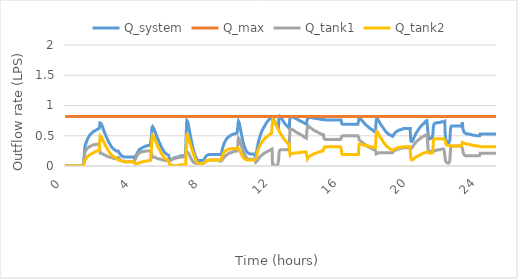
| Category | Q_system | Q_max | Q_tank1 | Q_tank2 |
|---|---|---|---|---|
| 0.0 | 0 | 0.82 | 0 | 0 |
| 0.016666666666666666 | 0 | 0.82 | 0 | 0 |
| 0.03333333333333333 | 0 | 0.82 | 0 | 0 |
| 0.05 | 0 | 0.82 | 0 | 0 |
| 0.06666666666666667 | 0 | 0.82 | 0 | 0 |
| 0.08333333333333333 | 0 | 0.82 | 0 | 0 |
| 0.09999999999999999 | 0 | 0.82 | 0 | 0 |
| 0.11666666666666665 | 0 | 0.82 | 0 | 0 |
| 0.13333333333333333 | 0 | 0.82 | 0 | 0 |
| 0.15 | 0 | 0.82 | 0 | 0 |
| 0.16666666666666666 | 0 | 0.82 | 0 | 0 |
| 0.18333333333333332 | 0 | 0.82 | 0 | 0 |
| 0.19999999999999998 | 0 | 0.82 | 0 | 0 |
| 0.21666666666666665 | 0 | 0.82 | 0 | 0 |
| 0.2333333333333333 | 0 | 0.82 | 0 | 0 |
| 0.24999999999999997 | 0 | 0.82 | 0 | 0 |
| 0.26666666666666666 | 0 | 0.82 | 0 | 0 |
| 0.2833333333333333 | 0 | 0.82 | 0 | 0 |
| 0.3 | 0 | 0.82 | 0 | 0 |
| 0.31666666666666665 | 0 | 0.82 | 0 | 0 |
| 0.3333333333333333 | 0 | 0.82 | 0 | 0 |
| 0.35 | 0 | 0.82 | 0 | 0 |
| 0.36666666666666664 | 0 | 0.82 | 0 | 0 |
| 0.3833333333333333 | 0 | 0.82 | 0 | 0 |
| 0.39999999999999997 | 0 | 0.82 | 0 | 0 |
| 0.41666666666666663 | 0 | 0.82 | 0 | 0 |
| 0.4333333333333333 | 0 | 0.82 | 0 | 0 |
| 0.44999999999999996 | 0 | 0.82 | 0 | 0 |
| 0.4666666666666666 | 0 | 0.82 | 0 | 0 |
| 0.4833333333333333 | 0 | 0.82 | 0 | 0 |
| 0.49999999999999994 | 0 | 0.82 | 0 | 0 |
| 0.5166666666666666 | 0 | 0.82 | 0 | 0 |
| 0.5333333333333333 | 0 | 0.82 | 0 | 0 |
| 0.55 | 0 | 0.82 | 0 | 0 |
| 0.5666666666666668 | 0 | 0.82 | 0 | 0 |
| 0.5833333333333335 | 0 | 0.82 | 0 | 0 |
| 0.6000000000000002 | 0 | 0.82 | 0 | 0 |
| 0.6166666666666669 | 0 | 0.82 | 0 | 0 |
| 0.6333333333333336 | 0 | 0.82 | 0 | 0 |
| 0.6500000000000004 | 0 | 0.82 | 0 | 0 |
| 0.6666666666666671 | 0 | 0.82 | 0 | 0 |
| 0.6833333333333338 | 0 | 0.82 | 0 | 0 |
| 0.7000000000000005 | 0 | 0.82 | 0 | 0 |
| 0.7166666666666672 | 0 | 0.82 | 0 | 0 |
| 0.733333333333334 | 0 | 0.82 | 0 | 0 |
| 0.7500000000000007 | 0 | 0.82 | 0 | 0 |
| 0.7666666666666674 | 0 | 0.82 | 0 | 0 |
| 0.7833333333333341 | 0 | 0.82 | 0 | 0 |
| 0.8000000000000008 | 0 | 0.82 | 0 | 0 |
| 0.8166666666666675 | 0 | 0.82 | 0 | 0 |
| 0.8333333333333343 | 0 | 0.82 | 0 | 0 |
| 0.850000000000001 | 0 | 0.82 | 0 | 0 |
| 0.8666666666666677 | 0 | 0.82 | 0 | 0 |
| 0.8833333333333344 | 0 | 0.82 | 0 | 0 |
| 0.9000000000000011 | 0 | 0.82 | 0 | 0 |
| 0.9166666666666679 | 0 | 0.82 | 0 | 0 |
| 0.9333333333333346 | 0 | 0.82 | 0 | 0 |
| 0.9500000000000013 | 0 | 0.82 | 0 | 0 |
| 0.966666666666668 | 0 | 0.82 | 0 | 0 |
| 0.9833333333333347 | 0 | 0.82 | 0 | 0 |
| 1.0000000000000013 | 0 | 0.82 | 0 | 0 |
| 1.016666666666668 | 0 | 0.82 | 0 | 0 |
| 1.0333333333333345 | 0 | 0.82 | 0 | 0 |
| 1.0500000000000012 | 0.01 | 0.82 | 0.01 | 0 |
| 1.0666666666666678 | 0.04 | 0.82 | 0.03 | 0.01 |
| 1.0833333333333344 | 0.08 | 0.82 | 0.06 | 0.02 |
| 1.100000000000001 | 0.14 | 0.82 | 0.11 | 0.04 |
| 1.1166666666666676 | 0.23 | 0.82 | 0.16 | 0.06 |
| 1.1333333333333342 | 0.29 | 0.82 | 0.21 | 0.08 |
| 1.1500000000000008 | 0.33 | 0.82 | 0.23 | 0.09 |
| 1.1666666666666674 | 0.35 | 0.82 | 0.24 | 0.1 |
| 1.183333333333334 | 0.36 | 0.82 | 0.25 | 0.11 |
| 1.2000000000000006 | 0.37 | 0.82 | 0.25 | 0.11 |
| 1.2166666666666672 | 0.38 | 0.82 | 0.26 | 0.12 |
| 1.2333333333333338 | 0.4 | 0.82 | 0.27 | 0.13 |
| 1.2500000000000004 | 0.41 | 0.82 | 0.27 | 0.14 |
| 1.266666666666667 | 0.42 | 0.82 | 0.28 | 0.14 |
| 1.2833333333333337 | 0.44 | 0.82 | 0.29 | 0.15 |
| 1.3000000000000003 | 0.45 | 0.82 | 0.29 | 0.15 |
| 1.3166666666666669 | 0.46 | 0.82 | 0.3 | 0.16 |
| 1.3333333333333335 | 0.47 | 0.82 | 0.3 | 0.16 |
| 1.35 | 0.47 | 0.82 | 0.31 | 0.17 |
| 1.3666666666666667 | 0.48 | 0.82 | 0.31 | 0.17 |
| 1.3833333333333333 | 0.49 | 0.82 | 0.31 | 0.18 |
| 1.4 | 0.5 | 0.82 | 0.32 | 0.18 |
| 1.4166666666666665 | 0.5 | 0.82 | 0.32 | 0.18 |
| 1.4333333333333331 | 0.51 | 0.82 | 0.32 | 0.19 |
| 1.4499999999999997 | 0.52 | 0.82 | 0.33 | 0.19 |
| 1.4666666666666663 | 0.52 | 0.82 | 0.33 | 0.19 |
| 1.483333333333333 | 0.53 | 0.82 | 0.33 | 0.2 |
| 1.4999999999999996 | 0.53 | 0.82 | 0.33 | 0.2 |
| 1.5166666666666662 | 0.54 | 0.82 | 0.34 | 0.2 |
| 1.5333333333333328 | 0.54 | 0.82 | 0.34 | 0.2 |
| 1.5499999999999994 | 0.55 | 0.82 | 0.34 | 0.21 |
| 1.566666666666666 | 0.55 | 0.82 | 0.34 | 0.21 |
| 1.5833333333333326 | 0.55 | 0.82 | 0.34 | 0.21 |
| 1.5999999999999992 | 0.56 | 0.82 | 0.34 | 0.21 |
| 1.6166666666666658 | 0.56 | 0.82 | 0.35 | 0.22 |
| 1.6333333333333324 | 0.57 | 0.82 | 0.35 | 0.22 |
| 1.649999999999999 | 0.57 | 0.82 | 0.35 | 0.22 |
| 1.6666666666666656 | 0.57 | 0.82 | 0.35 | 0.22 |
| 1.6833333333333322 | 0.58 | 0.82 | 0.35 | 0.23 |
| 1.6999999999999988 | 0.58 | 0.82 | 0.35 | 0.23 |
| 1.7166666666666655 | 0.58 | 0.82 | 0.35 | 0.23 |
| 1.733333333333332 | 0.59 | 0.82 | 0.35 | 0.23 |
| 1.7499999999999987 | 0.59 | 0.82 | 0.35 | 0.23 |
| 1.7666666666666653 | 0.59 | 0.82 | 0.35 | 0.24 |
| 1.7833333333333319 | 0.59 | 0.82 | 0.36 | 0.24 |
| 1.7999999999999985 | 0.6 | 0.82 | 0.36 | 0.24 |
| 1.816666666666665 | 0.6 | 0.82 | 0.36 | 0.24 |
| 1.8333333333333317 | 0.6 | 0.82 | 0.36 | 0.24 |
| 1.8499999999999983 | 0.6 | 0.82 | 0.36 | 0.25 |
| 1.866666666666665 | 0.61 | 0.82 | 0.36 | 0.25 |
| 1.8833333333333315 | 0.61 | 0.82 | 0.36 | 0.25 |
| 1.8999999999999981 | 0.61 | 0.82 | 0.36 | 0.25 |
| 1.9166666666666647 | 0.61 | 0.82 | 0.36 | 0.25 |
| 1.9333333333333313 | 0.61 | 0.82 | 0.36 | 0.25 |
| 1.949999999999998 | 0.62 | 0.82 | 0.36 | 0.25 |
| 1.9666666666666646 | 0.62 | 0.82 | 0.36 | 0.26 |
| 1.9833333333333312 | 0.62 | 0.82 | 0.36 | 0.26 |
| 1.9999999999999978 | 0.67 | 0.82 | 0.3 | 0.37 |
| 2.0166666666666644 | 0.71 | 0.82 | 0.24 | 0.47 |
| 2.033333333333331 | 0.71 | 0.82 | 0.21 | 0.5 |
| 2.0499999999999976 | 0.71 | 0.82 | 0.21 | 0.5 |
| 2.066666666666664 | 0.71 | 0.82 | 0.21 | 0.5 |
| 2.083333333333331 | 0.7 | 0.82 | 0.21 | 0.49 |
| 2.0999999999999974 | 0.69 | 0.82 | 0.21 | 0.48 |
| 2.116666666666664 | 0.68 | 0.82 | 0.21 | 0.47 |
| 2.1333333333333306 | 0.67 | 0.82 | 0.2 | 0.46 |
| 2.1499999999999972 | 0.66 | 0.82 | 0.2 | 0.45 |
| 2.166666666666664 | 0.64 | 0.82 | 0.2 | 0.44 |
| 2.1833333333333305 | 0.63 | 0.82 | 0.2 | 0.43 |
| 2.199999999999997 | 0.62 | 0.82 | 0.19 | 0.42 |
| 2.2166666666666637 | 0.6 | 0.82 | 0.19 | 0.41 |
| 2.2333333333333303 | 0.59 | 0.82 | 0.19 | 0.4 |
| 2.249999999999997 | 0.58 | 0.82 | 0.19 | 0.39 |
| 2.2666666666666635 | 0.57 | 0.82 | 0.18 | 0.38 |
| 2.28333333333333 | 0.55 | 0.82 | 0.18 | 0.37 |
| 2.2999999999999967 | 0.54 | 0.82 | 0.18 | 0.36 |
| 2.3166666666666633 | 0.53 | 0.82 | 0.18 | 0.35 |
| 2.33333333333333 | 0.52 | 0.82 | 0.17 | 0.34 |
| 2.3499999999999965 | 0.51 | 0.82 | 0.17 | 0.34 |
| 2.366666666666663 | 0.5 | 0.82 | 0.17 | 0.33 |
| 2.3833333333333298 | 0.48 | 0.82 | 0.17 | 0.32 |
| 2.3999999999999964 | 0.47 | 0.82 | 0.17 | 0.31 |
| 2.416666666666663 | 0.46 | 0.82 | 0.16 | 0.3 |
| 2.4333333333333296 | 0.45 | 0.82 | 0.16 | 0.29 |
| 2.449999999999996 | 0.44 | 0.82 | 0.16 | 0.28 |
| 2.466666666666663 | 0.43 | 0.82 | 0.16 | 0.28 |
| 2.4833333333333294 | 0.42 | 0.82 | 0.16 | 0.27 |
| 2.499999999999996 | 0.41 | 0.82 | 0.15 | 0.26 |
| 2.5166666666666626 | 0.4 | 0.82 | 0.15 | 0.25 |
| 2.533333333333329 | 0.39 | 0.82 | 0.15 | 0.24 |
| 2.549999999999996 | 0.38 | 0.82 | 0.15 | 0.24 |
| 2.5666666666666624 | 0.38 | 0.82 | 0.15 | 0.23 |
| 2.583333333333329 | 0.37 | 0.82 | 0.14 | 0.22 |
| 2.5999999999999956 | 0.36 | 0.82 | 0.14 | 0.22 |
| 2.6166666666666623 | 0.35 | 0.82 | 0.14 | 0.21 |
| 2.633333333333329 | 0.34 | 0.82 | 0.14 | 0.2 |
| 2.6499999999999955 | 0.34 | 0.82 | 0.14 | 0.2 |
| 2.666666666666662 | 0.33 | 0.82 | 0.14 | 0.19 |
| 2.6833333333333287 | 0.32 | 0.82 | 0.14 | 0.19 |
| 2.6999999999999953 | 0.32 | 0.82 | 0.14 | 0.18 |
| 2.716666666666662 | 0.31 | 0.82 | 0.13 | 0.18 |
| 2.7333333333333285 | 0.3 | 0.82 | 0.13 | 0.17 |
| 2.749999999999995 | 0.3 | 0.82 | 0.13 | 0.17 |
| 2.7666666666666617 | 0.29 | 0.82 | 0.13 | 0.16 |
| 2.7833333333333283 | 0.29 | 0.82 | 0.13 | 0.16 |
| 2.799999999999995 | 0.28 | 0.82 | 0.13 | 0.15 |
| 2.8166666666666615 | 0.28 | 0.82 | 0.13 | 0.15 |
| 2.833333333333328 | 0.27 | 0.82 | 0.13 | 0.15 |
| 2.8499999999999948 | 0.27 | 0.82 | 0.13 | 0.14 |
| 2.8666666666666614 | 0.27 | 0.82 | 0.13 | 0.14 |
| 2.883333333333328 | 0.26 | 0.82 | 0.12 | 0.14 |
| 2.8999999999999946 | 0.26 | 0.82 | 0.12 | 0.14 |
| 2.916666666666661 | 0.26 | 0.82 | 0.12 | 0.13 |
| 2.933333333333328 | 0.25 | 0.82 | 0.12 | 0.13 |
| 2.9499999999999944 | 0.25 | 0.82 | 0.12 | 0.13 |
| 2.966666666666661 | 0.25 | 0.82 | 0.12 | 0.13 |
| 2.9833333333333276 | 0.25 | 0.82 | 0.12 | 0.13 |
| 2.9999999999999942 | 0.25 | 0.82 | 0.13 | 0.12 |
| 3.016666666666661 | 0.26 | 0.82 | 0.14 | 0.11 |
| 3.0333333333333274 | 0.25 | 0.82 | 0.15 | 0.11 |
| 3.049999999999994 | 0.25 | 0.82 | 0.15 | 0.11 |
| 3.0666666666666607 | 0.25 | 0.82 | 0.14 | 0.1 |
| 3.0833333333333273 | 0.24 | 0.82 | 0.14 | 0.1 |
| 3.099999999999994 | 0.23 | 0.82 | 0.14 | 0.1 |
| 3.1166666666666605 | 0.23 | 0.82 | 0.13 | 0.1 |
| 3.133333333333327 | 0.22 | 0.82 | 0.13 | 0.09 |
| 3.1499999999999937 | 0.21 | 0.82 | 0.12 | 0.09 |
| 3.1666666666666603 | 0.21 | 0.82 | 0.12 | 0.09 |
| 3.183333333333327 | 0.2 | 0.82 | 0.11 | 0.09 |
| 3.1999999999999935 | 0.19 | 0.82 | 0.11 | 0.09 |
| 3.21666666666666 | 0.19 | 0.82 | 0.1 | 0.09 |
| 3.2333333333333267 | 0.18 | 0.82 | 0.1 | 0.08 |
| 3.2499999999999933 | 0.18 | 0.82 | 0.1 | 0.08 |
| 3.26666666666666 | 0.17 | 0.82 | 0.09 | 0.08 |
| 3.2833333333333266 | 0.17 | 0.82 | 0.09 | 0.08 |
| 3.299999999999993 | 0.17 | 0.82 | 0.09 | 0.08 |
| 3.3166666666666598 | 0.16 | 0.82 | 0.09 | 0.08 |
| 3.3333333333333264 | 0.16 | 0.82 | 0.08 | 0.08 |
| 3.349999999999993 | 0.16 | 0.82 | 0.08 | 0.08 |
| 3.3666666666666596 | 0.16 | 0.82 | 0.08 | 0.08 |
| 3.383333333333326 | 0.15 | 0.82 | 0.08 | 0.08 |
| 3.399999999999993 | 0.15 | 0.82 | 0.08 | 0.07 |
| 3.4166666666666594 | 0.15 | 0.82 | 0.08 | 0.07 |
| 3.433333333333326 | 0.15 | 0.82 | 0.08 | 0.07 |
| 3.4499999999999926 | 0.15 | 0.82 | 0.08 | 0.07 |
| 3.4666666666666592 | 0.15 | 0.82 | 0.07 | 0.07 |
| 3.483333333333326 | 0.15 | 0.82 | 0.07 | 0.07 |
| 3.4999999999999925 | 0.15 | 0.82 | 0.07 | 0.07 |
| 3.516666666666659 | 0.15 | 0.82 | 0.07 | 0.07 |
| 3.5333333333333257 | 0.15 | 0.82 | 0.07 | 0.07 |
| 3.5499999999999923 | 0.15 | 0.82 | 0.07 | 0.07 |
| 3.566666666666659 | 0.15 | 0.82 | 0.07 | 0.07 |
| 3.5833333333333255 | 0.15 | 0.82 | 0.07 | 0.07 |
| 3.599999999999992 | 0.15 | 0.82 | 0.07 | 0.07 |
| 3.6166666666666587 | 0.15 | 0.82 | 0.07 | 0.07 |
| 3.6333333333333253 | 0.15 | 0.82 | 0.07 | 0.07 |
| 3.649999999999992 | 0.15 | 0.82 | 0.07 | 0.07 |
| 3.6666666666666585 | 0.15 | 0.82 | 0.07 | 0.07 |
| 3.683333333333325 | 0.15 | 0.82 | 0.07 | 0.07 |
| 3.6999999999999917 | 0.15 | 0.82 | 0.07 | 0.07 |
| 3.7166666666666583 | 0.15 | 0.82 | 0.07 | 0.07 |
| 3.733333333333325 | 0.15 | 0.82 | 0.07 | 0.07 |
| 3.7499999999999916 | 0.15 | 0.82 | 0.07 | 0.07 |
| 3.766666666666658 | 0.15 | 0.82 | 0.07 | 0.07 |
| 3.7833333333333248 | 0.15 | 0.82 | 0.07 | 0.07 |
| 3.7999999999999914 | 0.15 | 0.82 | 0.07 | 0.07 |
| 3.816666666666658 | 0.15 | 0.82 | 0.07 | 0.07 |
| 3.8333333333333246 | 0.15 | 0.82 | 0.07 | 0.07 |
| 3.849999999999991 | 0.15 | 0.82 | 0.07 | 0.07 |
| 3.866666666666658 | 0.15 | 0.82 | 0.07 | 0.07 |
| 3.8833333333333244 | 0.15 | 0.82 | 0.07 | 0.07 |
| 3.899999999999991 | 0.15 | 0.82 | 0.07 | 0.07 |
| 3.9166666666666576 | 0.15 | 0.82 | 0.07 | 0.07 |
| 3.9333333333333242 | 0.15 | 0.82 | 0.07 | 0.07 |
| 3.949999999999991 | 0.15 | 0.82 | 0.07 | 0.07 |
| 3.9666666666666575 | 0.15 | 0.82 | 0.07 | 0.07 |
| 3.983333333333324 | 0.15 | 0.82 | 0.07 | 0.07 |
| 3.9999999999999907 | 0.13 | 0.82 | 0.08 | 0.06 |
| 4.016666666666658 | 0.13 | 0.82 | 0.08 | 0.05 |
| 4.033333333333324 | 0.13 | 0.82 | 0.09 | 0.04 |
| 4.049999999999991 | 0.13 | 0.82 | 0.1 | 0.04 |
| 4.0666666666666575 | 0.14 | 0.82 | 0.11 | 0.03 |
| 4.083333333333324 | 0.16 | 0.82 | 0.12 | 0.03 |
| 4.099999999999991 | 0.17 | 0.82 | 0.13 | 0.03 |
| 4.116666666666657 | 0.18 | 0.82 | 0.15 | 0.03 |
| 4.133333333333324 | 0.19 | 0.82 | 0.16 | 0.04 |
| 4.149999999999991 | 0.2 | 0.82 | 0.16 | 0.04 |
| 4.166666666666657 | 0.21 | 0.82 | 0.17 | 0.04 |
| 4.183333333333324 | 0.22 | 0.82 | 0.18 | 0.04 |
| 4.19999999999999 | 0.23 | 0.82 | 0.19 | 0.04 |
| 4.216666666666657 | 0.23 | 0.82 | 0.19 | 0.04 |
| 4.233333333333324 | 0.24 | 0.82 | 0.2 | 0.04 |
| 4.24999999999999 | 0.25 | 0.82 | 0.2 | 0.05 |
| 4.266666666666657 | 0.26 | 0.82 | 0.21 | 0.05 |
| 4.2833333333333234 | 0.26 | 0.82 | 0.21 | 0.05 |
| 4.29999999999999 | 0.27 | 0.82 | 0.21 | 0.05 |
| 4.316666666666657 | 0.27 | 0.82 | 0.22 | 0.05 |
| 4.333333333333323 | 0.28 | 0.82 | 0.22 | 0.06 |
| 4.34999999999999 | 0.28 | 0.82 | 0.22 | 0.06 |
| 4.3666666666666565 | 0.28 | 0.82 | 0.23 | 0.06 |
| 4.383333333333323 | 0.29 | 0.82 | 0.23 | 0.06 |
| 4.39999999999999 | 0.29 | 0.82 | 0.23 | 0.06 |
| 4.416666666666656 | 0.29 | 0.82 | 0.23 | 0.06 |
| 4.433333333333323 | 0.3 | 0.82 | 0.23 | 0.06 |
| 4.4499999999999895 | 0.3 | 0.82 | 0.23 | 0.07 |
| 4.466666666666656 | 0.3 | 0.82 | 0.24 | 0.07 |
| 4.483333333333323 | 0.3 | 0.82 | 0.24 | 0.07 |
| 4.499999999999989 | 0.31 | 0.82 | 0.24 | 0.07 |
| 4.516666666666656 | 0.31 | 0.82 | 0.24 | 0.07 |
| 4.533333333333323 | 0.31 | 0.82 | 0.24 | 0.07 |
| 4.549999999999989 | 0.31 | 0.82 | 0.24 | 0.07 |
| 4.566666666666656 | 0.32 | 0.82 | 0.24 | 0.07 |
| 4.583333333333322 | 0.32 | 0.82 | 0.24 | 0.08 |
| 4.599999999999989 | 0.32 | 0.82 | 0.24 | 0.08 |
| 4.616666666666656 | 0.32 | 0.82 | 0.24 | 0.08 |
| 4.633333333333322 | 0.32 | 0.82 | 0.24 | 0.08 |
| 4.649999999999989 | 0.32 | 0.82 | 0.25 | 0.08 |
| 4.666666666666655 | 0.33 | 0.82 | 0.25 | 0.08 |
| 4.683333333333322 | 0.33 | 0.82 | 0.25 | 0.08 |
| 4.699999999999989 | 0.33 | 0.82 | 0.25 | 0.08 |
| 4.716666666666655 | 0.33 | 0.82 | 0.25 | 0.08 |
| 4.733333333333322 | 0.33 | 0.82 | 0.25 | 0.08 |
| 4.7499999999999885 | 0.33 | 0.82 | 0.25 | 0.09 |
| 4.766666666666655 | 0.33 | 0.82 | 0.25 | 0.09 |
| 4.783333333333322 | 0.34 | 0.82 | 0.25 | 0.09 |
| 4.799999999999988 | 0.34 | 0.82 | 0.25 | 0.09 |
| 4.816666666666655 | 0.34 | 0.82 | 0.25 | 0.09 |
| 4.8333333333333215 | 0.34 | 0.82 | 0.25 | 0.09 |
| 4.849999999999988 | 0.34 | 0.82 | 0.25 | 0.09 |
| 4.866666666666655 | 0.34 | 0.82 | 0.25 | 0.09 |
| 4.883333333333321 | 0.34 | 0.82 | 0.25 | 0.09 |
| 4.899999999999988 | 0.34 | 0.82 | 0.25 | 0.09 |
| 4.9166666666666545 | 0.34 | 0.82 | 0.25 | 0.09 |
| 4.933333333333321 | 0.35 | 0.82 | 0.25 | 0.09 |
| 4.949999999999988 | 0.35 | 0.82 | 0.25 | 0.09 |
| 4.966666666666654 | 0.35 | 0.82 | 0.25 | 0.1 |
| 4.983333333333321 | 0.35 | 0.82 | 0.25 | 0.1 |
| 4.999999999999988 | 0.5 | 0.82 | 0.21 | 0.29 |
| 5.016666666666654 | 0.59 | 0.82 | 0.18 | 0.42 |
| 5.033333333333321 | 0.63 | 0.82 | 0.14 | 0.49 |
| 5.049999999999987 | 0.64 | 0.82 | 0.13 | 0.51 |
| 5.066666666666654 | 0.65 | 0.82 | 0.13 | 0.51 |
| 5.083333333333321 | 0.65 | 0.82 | 0.14 | 0.51 |
| 5.099999999999987 | 0.64 | 0.82 | 0.15 | 0.5 |
| 5.116666666666654 | 0.63 | 0.82 | 0.15 | 0.49 |
| 5.13333333333332 | 0.62 | 0.82 | 0.15 | 0.48 |
| 5.149999999999987 | 0.61 | 0.82 | 0.15 | 0.46 |
| 5.166666666666654 | 0.6 | 0.82 | 0.15 | 0.45 |
| 5.18333333333332 | 0.59 | 0.82 | 0.14 | 0.44 |
| 5.199999999999987 | 0.57 | 0.82 | 0.14 | 0.43 |
| 5.2166666666666535 | 0.56 | 0.82 | 0.14 | 0.42 |
| 5.23333333333332 | 0.55 | 0.82 | 0.14 | 0.41 |
| 5.249999999999987 | 0.53 | 0.82 | 0.14 | 0.4 |
| 5.266666666666653 | 0.52 | 0.82 | 0.13 | 0.39 |
| 5.28333333333332 | 0.51 | 0.82 | 0.13 | 0.38 |
| 5.2999999999999865 | 0.5 | 0.82 | 0.13 | 0.37 |
| 5.316666666666653 | 0.48 | 0.82 | 0.13 | 0.36 |
| 5.33333333333332 | 0.47 | 0.82 | 0.13 | 0.34 |
| 5.349999999999986 | 0.46 | 0.82 | 0.12 | 0.33 |
| 5.366666666666653 | 0.45 | 0.82 | 0.12 | 0.32 |
| 5.3833333333333195 | 0.44 | 0.82 | 0.12 | 0.31 |
| 5.399999999999986 | 0.42 | 0.82 | 0.12 | 0.3 |
| 5.416666666666653 | 0.41 | 0.82 | 0.12 | 0.29 |
| 5.433333333333319 | 0.4 | 0.82 | 0.12 | 0.29 |
| 5.449999999999986 | 0.39 | 0.82 | 0.11 | 0.28 |
| 5.466666666666653 | 0.38 | 0.82 | 0.11 | 0.27 |
| 5.483333333333319 | 0.37 | 0.82 | 0.11 | 0.26 |
| 5.499999999999986 | 0.36 | 0.82 | 0.11 | 0.25 |
| 5.516666666666652 | 0.35 | 0.82 | 0.11 | 0.24 |
| 5.533333333333319 | 0.34 | 0.82 | 0.11 | 0.23 |
| 5.549999999999986 | 0.33 | 0.82 | 0.11 | 0.22 |
| 5.566666666666652 | 0.32 | 0.82 | 0.11 | 0.21 |
| 5.583333333333319 | 0.31 | 0.82 | 0.1 | 0.2 |
| 5.599999999999985 | 0.3 | 0.82 | 0.1 | 0.2 |
| 5.616666666666652 | 0.29 | 0.82 | 0.1 | 0.19 |
| 5.633333333333319 | 0.28 | 0.82 | 0.1 | 0.18 |
| 5.649999999999985 | 0.28 | 0.82 | 0.1 | 0.17 |
| 5.666666666666652 | 0.27 | 0.82 | 0.1 | 0.17 |
| 5.6833333333333185 | 0.26 | 0.82 | 0.1 | 0.16 |
| 5.699999999999985 | 0.25 | 0.82 | 0.1 | 0.16 |
| 5.716666666666652 | 0.24 | 0.82 | 0.1 | 0.15 |
| 5.733333333333318 | 0.24 | 0.82 | 0.09 | 0.14 |
| 5.749999999999985 | 0.23 | 0.82 | 0.09 | 0.14 |
| 5.7666666666666515 | 0.23 | 0.82 | 0.09 | 0.13 |
| 5.783333333333318 | 0.22 | 0.82 | 0.09 | 0.13 |
| 5.799999999999985 | 0.22 | 0.82 | 0.09 | 0.12 |
| 5.816666666666651 | 0.21 | 0.82 | 0.09 | 0.12 |
| 5.833333333333318 | 0.21 | 0.82 | 0.09 | 0.12 |
| 5.8499999999999845 | 0.2 | 0.82 | 0.09 | 0.11 |
| 5.866666666666651 | 0.2 | 0.82 | 0.09 | 0.11 |
| 5.883333333333318 | 0.2 | 0.82 | 0.09 | 0.11 |
| 5.899999999999984 | 0.19 | 0.82 | 0.09 | 0.1 |
| 5.916666666666651 | 0.19 | 0.82 | 0.09 | 0.1 |
| 5.933333333333318 | 0.19 | 0.82 | 0.09 | 0.1 |
| 5.949999999999984 | 0.19 | 0.82 | 0.09 | 0.1 |
| 5.966666666666651 | 0.18 | 0.82 | 0.09 | 0.1 |
| 5.983333333333317 | 0.18 | 0.82 | 0.09 | 0.09 |
| 5.999999999999984 | 0.16 | 0.82 | 0.09 | 0.07 |
| 6.016666666666651 | 0.14 | 0.82 | 0.08 | 0.05 |
| 6.033333333333317 | 0.12 | 0.82 | 0.08 | 0.04 |
| 6.049999999999984 | 0.11 | 0.82 | 0.08 | 0.03 |
| 6.06666666666665 | 0.11 | 0.82 | 0.08 | 0.03 |
| 6.083333333333317 | 0.11 | 0.82 | 0.09 | 0.02 |
| 6.099999999999984 | 0.11 | 0.82 | 0.09 | 0.02 |
| 6.11666666666665 | 0.11 | 0.82 | 0.09 | 0.02 |
| 6.133333333333317 | 0.11 | 0.82 | 0.09 | 0.02 |
| 6.1499999999999835 | 0.11 | 0.82 | 0.1 | 0.01 |
| 6.16666666666665 | 0.11 | 0.82 | 0.1 | 0.01 |
| 6.183333333333317 | 0.12 | 0.82 | 0.1 | 0.01 |
| 6.199999999999983 | 0.12 | 0.82 | 0.11 | 0.01 |
| 6.21666666666665 | 0.12 | 0.82 | 0.11 | 0.01 |
| 6.2333333333333165 | 0.12 | 0.82 | 0.11 | 0.01 |
| 6.249999999999983 | 0.13 | 0.82 | 0.11 | 0.01 |
| 6.26666666666665 | 0.13 | 0.82 | 0.12 | 0.01 |
| 6.283333333333316 | 0.13 | 0.82 | 0.12 | 0.01 |
| 6.299999999999983 | 0.13 | 0.82 | 0.12 | 0.01 |
| 6.3166666666666496 | 0.13 | 0.82 | 0.12 | 0.01 |
| 6.333333333333316 | 0.13 | 0.82 | 0.12 | 0.01 |
| 6.349999999999983 | 0.14 | 0.82 | 0.13 | 0.01 |
| 6.366666666666649 | 0.14 | 0.82 | 0.13 | 0.01 |
| 6.383333333333316 | 0.14 | 0.82 | 0.13 | 0.01 |
| 6.399999999999983 | 0.14 | 0.82 | 0.13 | 0.01 |
| 6.416666666666649 | 0.14 | 0.82 | 0.13 | 0.01 |
| 6.433333333333316 | 0.14 | 0.82 | 0.13 | 0.01 |
| 6.449999999999982 | 0.15 | 0.82 | 0.13 | 0.01 |
| 6.466666666666649 | 0.15 | 0.82 | 0.13 | 0.01 |
| 6.483333333333316 | 0.15 | 0.82 | 0.14 | 0.01 |
| 6.499999999999982 | 0.15 | 0.82 | 0.14 | 0.01 |
| 6.516666666666649 | 0.15 | 0.82 | 0.14 | 0.01 |
| 6.5333333333333155 | 0.15 | 0.82 | 0.14 | 0.01 |
| 6.549999999999982 | 0.15 | 0.82 | 0.14 | 0.01 |
| 6.566666666666649 | 0.15 | 0.82 | 0.14 | 0.01 |
| 6.583333333333315 | 0.16 | 0.82 | 0.14 | 0.01 |
| 6.599999999999982 | 0.16 | 0.82 | 0.14 | 0.01 |
| 6.6166666666666485 | 0.16 | 0.82 | 0.14 | 0.01 |
| 6.633333333333315 | 0.16 | 0.82 | 0.14 | 0.02 |
| 6.649999999999982 | 0.16 | 0.82 | 0.15 | 0.02 |
| 6.666666666666648 | 0.16 | 0.82 | 0.15 | 0.02 |
| 6.683333333333315 | 0.16 | 0.82 | 0.15 | 0.02 |
| 6.6999999999999815 | 0.16 | 0.82 | 0.15 | 0.02 |
| 6.716666666666648 | 0.16 | 0.82 | 0.15 | 0.02 |
| 6.733333333333315 | 0.17 | 0.82 | 0.15 | 0.02 |
| 6.749999999999981 | 0.17 | 0.82 | 0.15 | 0.02 |
| 6.766666666666648 | 0.17 | 0.82 | 0.15 | 0.02 |
| 6.783333333333315 | 0.17 | 0.82 | 0.15 | 0.02 |
| 6.799999999999981 | 0.17 | 0.82 | 0.15 | 0.02 |
| 6.816666666666648 | 0.17 | 0.82 | 0.15 | 0.02 |
| 6.833333333333314 | 0.17 | 0.82 | 0.15 | 0.02 |
| 6.849999999999981 | 0.17 | 0.82 | 0.15 | 0.02 |
| 6.866666666666648 | 0.17 | 0.82 | 0.15 | 0.02 |
| 6.883333333333314 | 0.17 | 0.82 | 0.15 | 0.02 |
| 6.899999999999981 | 0.17 | 0.82 | 0.15 | 0.02 |
| 6.916666666666647 | 0.17 | 0.82 | 0.15 | 0.02 |
| 6.933333333333314 | 0.17 | 0.82 | 0.15 | 0.02 |
| 6.949999999999981 | 0.17 | 0.82 | 0.16 | 0.02 |
| 6.966666666666647 | 0.18 | 0.82 | 0.16 | 0.02 |
| 6.983333333333314 | 0.18 | 0.82 | 0.16 | 0.02 |
| 6.9999999999999805 | 0.42 | 0.82 | 0.21 | 0.21 |
| 7.016666666666647 | 0.56 | 0.82 | 0.23 | 0.33 |
| 7.033333333333314 | 0.71 | 0.82 | 0.25 | 0.46 |
| 7.04999999999998 | 0.75 | 0.82 | 0.23 | 0.51 |
| 7.066666666666647 | 0.75 | 0.82 | 0.23 | 0.52 |
| 7.0833333333333135 | 0.74 | 0.82 | 0.23 | 0.51 |
| 7.09999999999998 | 0.73 | 0.82 | 0.23 | 0.5 |
| 7.116666666666647 | 0.71 | 0.82 | 0.22 | 0.49 |
| 7.133333333333313 | 0.69 | 0.82 | 0.22 | 0.47 |
| 7.14999999999998 | 0.66 | 0.82 | 0.21 | 0.46 |
| 7.1666666666666465 | 0.64 | 0.82 | 0.2 | 0.44 |
| 7.183333333333313 | 0.61 | 0.82 | 0.19 | 0.43 |
| 7.19999999999998 | 0.59 | 0.82 | 0.18 | 0.41 |
| 7.216666666666646 | 0.56 | 0.82 | 0.17 | 0.39 |
| 7.233333333333313 | 0.53 | 0.82 | 0.16 | 0.38 |
| 7.24999999999998 | 0.51 | 0.82 | 0.15 | 0.36 |
| 7.266666666666646 | 0.48 | 0.82 | 0.14 | 0.35 |
| 7.283333333333313 | 0.46 | 0.82 | 0.13 | 0.33 |
| 7.299999999999979 | 0.43 | 0.82 | 0.12 | 0.31 |
| 7.316666666666646 | 0.41 | 0.82 | 0.11 | 0.3 |
| 7.333333333333313 | 0.38 | 0.82 | 0.1 | 0.28 |
| 7.349999999999979 | 0.36 | 0.82 | 0.09 | 0.27 |
| 7.366666666666646 | 0.34 | 0.82 | 0.09 | 0.25 |
| 7.383333333333312 | 0.32 | 0.82 | 0.08 | 0.24 |
| 7.399999999999979 | 0.3 | 0.82 | 0.07 | 0.22 |
| 7.416666666666646 | 0.28 | 0.82 | 0.07 | 0.21 |
| 7.433333333333312 | 0.26 | 0.82 | 0.06 | 0.2 |
| 7.449999999999979 | 0.24 | 0.82 | 0.06 | 0.18 |
| 7.4666666666666455 | 0.23 | 0.82 | 0.06 | 0.17 |
| 7.483333333333312 | 0.21 | 0.82 | 0.05 | 0.16 |
| 7.499999999999979 | 0.2 | 0.82 | 0.05 | 0.14 |
| 7.516666666666645 | 0.18 | 0.82 | 0.05 | 0.13 |
| 7.533333333333312 | 0.17 | 0.82 | 0.05 | 0.12 |
| 7.5499999999999785 | 0.16 | 0.82 | 0.05 | 0.11 |
| 7.566666666666645 | 0.15 | 0.82 | 0.05 | 0.1 |
| 7.583333333333312 | 0.14 | 0.82 | 0.05 | 0.09 |
| 7.599999999999978 | 0.13 | 0.82 | 0.04 | 0.08 |
| 7.616666666666645 | 0.12 | 0.82 | 0.04 | 0.07 |
| 7.6333333333333115 | 0.11 | 0.82 | 0.04 | 0.06 |
| 7.649999999999978 | 0.1 | 0.82 | 0.04 | 0.06 |
| 7.666666666666645 | 0.1 | 0.82 | 0.04 | 0.05 |
| 7.683333333333311 | 0.09 | 0.82 | 0.04 | 0.05 |
| 7.699999999999978 | 0.09 | 0.82 | 0.04 | 0.05 |
| 7.716666666666645 | 0.09 | 0.82 | 0.04 | 0.05 |
| 7.733333333333311 | 0.09 | 0.82 | 0.04 | 0.05 |
| 7.749999999999978 | 0.09 | 0.82 | 0.04 | 0.05 |
| 7.766666666666644 | 0.09 | 0.82 | 0.04 | 0.04 |
| 7.783333333333311 | 0.09 | 0.82 | 0.04 | 0.04 |
| 7.799999999999978 | 0.09 | 0.82 | 0.04 | 0.04 |
| 7.816666666666644 | 0.09 | 0.82 | 0.04 | 0.04 |
| 7.833333333333311 | 0.09 | 0.82 | 0.04 | 0.04 |
| 7.849999999999977 | 0.09 | 0.82 | 0.04 | 0.04 |
| 7.866666666666644 | 0.09 | 0.82 | 0.04 | 0.04 |
| 7.883333333333311 | 0.09 | 0.82 | 0.04 | 0.04 |
| 7.899999999999977 | 0.09 | 0.82 | 0.04 | 0.04 |
| 7.916666666666644 | 0.09 | 0.82 | 0.04 | 0.04 |
| 7.9333333333333105 | 0.09 | 0.82 | 0.04 | 0.04 |
| 7.949999999999977 | 0.09 | 0.82 | 0.04 | 0.04 |
| 7.966666666666644 | 0.09 | 0.82 | 0.04 | 0.04 |
| 7.98333333333331 | 0.09 | 0.82 | 0.04 | 0.04 |
| 7.999999999999977 | 0.09 | 0.82 | 0.04 | 0.04 |
| 8.016666666666644 | 0.09 | 0.82 | 0.04 | 0.05 |
| 8.033333333333312 | 0.1 | 0.82 | 0.05 | 0.05 |
| 8.04999999999998 | 0.11 | 0.82 | 0.05 | 0.05 |
| 8.066666666666647 | 0.12 | 0.82 | 0.06 | 0.06 |
| 8.083333333333314 | 0.13 | 0.82 | 0.06 | 0.06 |
| 8.099999999999982 | 0.13 | 0.82 | 0.07 | 0.07 |
| 8.11666666666665 | 0.14 | 0.82 | 0.07 | 0.07 |
| 8.133333333333317 | 0.15 | 0.82 | 0.07 | 0.07 |
| 8.149999999999984 | 0.16 | 0.82 | 0.08 | 0.08 |
| 8.166666666666652 | 0.16 | 0.82 | 0.08 | 0.08 |
| 8.18333333333332 | 0.17 | 0.82 | 0.08 | 0.08 |
| 8.199999999999987 | 0.17 | 0.82 | 0.09 | 0.09 |
| 8.216666666666654 | 0.18 | 0.82 | 0.09 | 0.09 |
| 8.233333333333322 | 0.18 | 0.82 | 0.09 | 0.09 |
| 8.24999999999999 | 0.18 | 0.82 | 0.09 | 0.09 |
| 8.266666666666657 | 0.19 | 0.82 | 0.09 | 0.09 |
| 8.283333333333324 | 0.19 | 0.82 | 0.09 | 0.09 |
| 8.299999999999992 | 0.19 | 0.82 | 0.09 | 0.09 |
| 8.31666666666666 | 0.19 | 0.82 | 0.1 | 0.1 |
| 8.333333333333327 | 0.19 | 0.82 | 0.1 | 0.1 |
| 8.349999999999994 | 0.19 | 0.82 | 0.1 | 0.1 |
| 8.366666666666662 | 0.19 | 0.82 | 0.1 | 0.1 |
| 8.38333333333333 | 0.19 | 0.82 | 0.1 | 0.1 |
| 8.399999999999997 | 0.19 | 0.82 | 0.1 | 0.1 |
| 8.416666666666664 | 0.19 | 0.82 | 0.1 | 0.1 |
| 8.433333333333332 | 0.19 | 0.82 | 0.1 | 0.1 |
| 8.45 | 0.19 | 0.82 | 0.1 | 0.1 |
| 8.466666666666667 | 0.19 | 0.82 | 0.1 | 0.1 |
| 8.483333333333334 | 0.19 | 0.82 | 0.1 | 0.1 |
| 8.500000000000002 | 0.19 | 0.82 | 0.1 | 0.1 |
| 8.51666666666667 | 0.19 | 0.82 | 0.1 | 0.1 |
| 8.533333333333337 | 0.19 | 0.82 | 0.1 | 0.1 |
| 8.550000000000004 | 0.19 | 0.82 | 0.1 | 0.1 |
| 8.566666666666672 | 0.19 | 0.82 | 0.1 | 0.1 |
| 8.58333333333334 | 0.19 | 0.82 | 0.1 | 0.1 |
| 8.600000000000007 | 0.19 | 0.82 | 0.1 | 0.1 |
| 8.616666666666674 | 0.19 | 0.82 | 0.1 | 0.1 |
| 8.633333333333342 | 0.19 | 0.82 | 0.1 | 0.1 |
| 8.65000000000001 | 0.19 | 0.82 | 0.1 | 0.1 |
| 8.666666666666677 | 0.19 | 0.82 | 0.1 | 0.1 |
| 8.683333333333344 | 0.19 | 0.82 | 0.1 | 0.1 |
| 8.700000000000012 | 0.19 | 0.82 | 0.1 | 0.1 |
| 8.71666666666668 | 0.19 | 0.82 | 0.1 | 0.1 |
| 8.733333333333347 | 0.19 | 0.82 | 0.1 | 0.1 |
| 8.750000000000014 | 0.19 | 0.82 | 0.1 | 0.1 |
| 8.766666666666682 | 0.19 | 0.82 | 0.1 | 0.1 |
| 8.78333333333335 | 0.19 | 0.82 | 0.1 | 0.1 |
| 8.800000000000017 | 0.19 | 0.82 | 0.1 | 0.1 |
| 8.816666666666684 | 0.19 | 0.82 | 0.1 | 0.1 |
| 8.833333333333352 | 0.19 | 0.82 | 0.1 | 0.1 |
| 8.85000000000002 | 0.19 | 0.82 | 0.1 | 0.1 |
| 8.866666666666687 | 0.19 | 0.82 | 0.1 | 0.1 |
| 8.883333333333354 | 0.19 | 0.82 | 0.1 | 0.1 |
| 8.900000000000022 | 0.19 | 0.82 | 0.1 | 0.1 |
| 8.91666666666669 | 0.19 | 0.82 | 0.1 | 0.1 |
| 8.933333333333357 | 0.19 | 0.82 | 0.1 | 0.1 |
| 8.950000000000024 | 0.19 | 0.82 | 0.1 | 0.1 |
| 8.966666666666692 | 0.19 | 0.82 | 0.1 | 0.1 |
| 8.98333333333336 | 0.19 | 0.82 | 0.1 | 0.1 |
| 9.000000000000027 | 0.18 | 0.82 | 0.08 | 0.1 |
| 9.016666666666694 | 0.18 | 0.82 | 0.08 | 0.1 |
| 9.033333333333362 | 0.19 | 0.82 | 0.08 | 0.11 |
| 9.05000000000003 | 0.21 | 0.82 | 0.08 | 0.13 |
| 9.066666666666697 | 0.22 | 0.82 | 0.09 | 0.14 |
| 9.083333333333364 | 0.25 | 0.82 | 0.09 | 0.15 |
| 9.100000000000032 | 0.27 | 0.82 | 0.1 | 0.17 |
| 9.1166666666667 | 0.29 | 0.82 | 0.11 | 0.18 |
| 9.133333333333367 | 0.31 | 0.82 | 0.12 | 0.19 |
| 9.150000000000034 | 0.32 | 0.82 | 0.12 | 0.2 |
| 9.166666666666702 | 0.34 | 0.82 | 0.13 | 0.21 |
| 9.183333333333369 | 0.35 | 0.82 | 0.14 | 0.22 |
| 9.200000000000037 | 0.37 | 0.82 | 0.14 | 0.22 |
| 9.216666666666704 | 0.38 | 0.82 | 0.15 | 0.23 |
| 9.233333333333372 | 0.39 | 0.82 | 0.15 | 0.24 |
| 9.250000000000039 | 0.4 | 0.82 | 0.16 | 0.24 |
| 9.266666666666707 | 0.41 | 0.82 | 0.16 | 0.25 |
| 9.283333333333374 | 0.42 | 0.82 | 0.17 | 0.25 |
| 9.300000000000042 | 0.42 | 0.82 | 0.17 | 0.25 |
| 9.316666666666709 | 0.43 | 0.82 | 0.18 | 0.26 |
| 9.333333333333377 | 0.44 | 0.82 | 0.18 | 0.26 |
| 9.350000000000044 | 0.45 | 0.82 | 0.18 | 0.26 |
| 9.366666666666712 | 0.45 | 0.82 | 0.19 | 0.26 |
| 9.383333333333379 | 0.46 | 0.82 | 0.19 | 0.27 |
| 9.400000000000047 | 0.46 | 0.82 | 0.19 | 0.27 |
| 9.416666666666714 | 0.47 | 0.82 | 0.2 | 0.27 |
| 9.433333333333382 | 0.47 | 0.82 | 0.2 | 0.27 |
| 9.450000000000049 | 0.48 | 0.82 | 0.2 | 0.27 |
| 9.466666666666717 | 0.48 | 0.82 | 0.2 | 0.28 |
| 9.483333333333384 | 0.48 | 0.82 | 0.21 | 0.28 |
| 9.500000000000052 | 0.49 | 0.82 | 0.21 | 0.28 |
| 9.516666666666719 | 0.49 | 0.82 | 0.21 | 0.28 |
| 9.533333333333387 | 0.49 | 0.82 | 0.21 | 0.28 |
| 9.550000000000054 | 0.5 | 0.82 | 0.22 | 0.28 |
| 9.566666666666721 | 0.5 | 0.82 | 0.22 | 0.28 |
| 9.583333333333389 | 0.5 | 0.82 | 0.22 | 0.28 |
| 9.600000000000056 | 0.51 | 0.82 | 0.22 | 0.28 |
| 9.616666666666724 | 0.51 | 0.82 | 0.22 | 0.29 |
| 9.633333333333391 | 0.51 | 0.82 | 0.23 | 0.29 |
| 9.650000000000059 | 0.51 | 0.82 | 0.23 | 0.29 |
| 9.666666666666726 | 0.52 | 0.82 | 0.23 | 0.29 |
| 9.683333333333394 | 0.52 | 0.82 | 0.23 | 0.29 |
| 9.700000000000061 | 0.52 | 0.82 | 0.23 | 0.29 |
| 9.716666666666729 | 0.52 | 0.82 | 0.23 | 0.29 |
| 9.733333333333396 | 0.52 | 0.82 | 0.23 | 0.29 |
| 9.750000000000064 | 0.53 | 0.82 | 0.24 | 0.29 |
| 9.766666666666731 | 0.53 | 0.82 | 0.24 | 0.29 |
| 9.783333333333399 | 0.53 | 0.82 | 0.24 | 0.29 |
| 9.800000000000066 | 0.53 | 0.82 | 0.24 | 0.29 |
| 9.816666666666734 | 0.53 | 0.82 | 0.24 | 0.29 |
| 9.833333333333401 | 0.53 | 0.82 | 0.24 | 0.29 |
| 9.850000000000069 | 0.54 | 0.82 | 0.24 | 0.29 |
| 9.866666666666736 | 0.54 | 0.82 | 0.24 | 0.29 |
| 9.883333333333404 | 0.54 | 0.82 | 0.25 | 0.29 |
| 9.900000000000071 | 0.54 | 0.82 | 0.25 | 0.29 |
| 9.916666666666739 | 0.54 | 0.82 | 0.25 | 0.29 |
| 9.933333333333406 | 0.54 | 0.82 | 0.25 | 0.29 |
| 9.950000000000074 | 0.54 | 0.82 | 0.25 | 0.29 |
| 9.966666666666741 | 0.55 | 0.82 | 0.25 | 0.29 |
| 9.983333333333409 | 0.55 | 0.82 | 0.25 | 0.29 |
| 10.000000000000076 | 0.64 | 0.82 | 0.34 | 0.3 |
| 10.016666666666744 | 0.72 | 0.82 | 0.43 | 0.29 |
| 10.033333333333411 | 0.74 | 0.82 | 0.46 | 0.28 |
| 10.050000000000079 | 0.74 | 0.82 | 0.46 | 0.28 |
| 10.066666666666746 | 0.73 | 0.82 | 0.45 | 0.27 |
| 10.083333333333414 | 0.71 | 0.82 | 0.44 | 0.27 |
| 10.100000000000081 | 0.69 | 0.82 | 0.43 | 0.26 |
| 10.116666666666749 | 0.66 | 0.82 | 0.41 | 0.25 |
| 10.133333333333416 | 0.64 | 0.82 | 0.4 | 0.24 |
| 10.150000000000084 | 0.61 | 0.82 | 0.38 | 0.23 |
| 10.166666666666751 | 0.59 | 0.82 | 0.37 | 0.22 |
| 10.183333333333419 | 0.56 | 0.82 | 0.35 | 0.21 |
| 10.200000000000086 | 0.54 | 0.82 | 0.34 | 0.2 |
| 10.216666666666754 | 0.51 | 0.82 | 0.32 | 0.19 |
| 10.233333333333421 | 0.49 | 0.82 | 0.31 | 0.18 |
| 10.250000000000089 | 0.47 | 0.82 | 0.3 | 0.17 |
| 10.266666666666756 | 0.44 | 0.82 | 0.28 | 0.16 |
| 10.283333333333424 | 0.42 | 0.82 | 0.27 | 0.15 |
| 10.300000000000091 | 0.4 | 0.82 | 0.26 | 0.15 |
| 10.316666666666759 | 0.39 | 0.82 | 0.24 | 0.14 |
| 10.333333333333426 | 0.37 | 0.82 | 0.23 | 0.14 |
| 10.350000000000094 | 0.35 | 0.82 | 0.22 | 0.13 |
| 10.366666666666761 | 0.34 | 0.82 | 0.21 | 0.13 |
| 10.383333333333429 | 0.32 | 0.82 | 0.2 | 0.12 |
| 10.400000000000096 | 0.31 | 0.82 | 0.19 | 0.12 |
| 10.416666666666764 | 0.3 | 0.82 | 0.18 | 0.12 |
| 10.433333333333431 | 0.28 | 0.82 | 0.17 | 0.11 |
| 10.450000000000099 | 0.27 | 0.82 | 0.16 | 0.11 |
| 10.466666666666766 | 0.26 | 0.82 | 0.15 | 0.11 |
| 10.483333333333434 | 0.25 | 0.82 | 0.15 | 0.11 |
| 10.500000000000101 | 0.25 | 0.82 | 0.14 | 0.11 |
| 10.516666666666769 | 0.24 | 0.82 | 0.13 | 0.1 |
| 10.533333333333436 | 0.23 | 0.82 | 0.13 | 0.1 |
| 10.550000000000104 | 0.23 | 0.82 | 0.12 | 0.1 |
| 10.566666666666771 | 0.22 | 0.82 | 0.12 | 0.1 |
| 10.583333333333439 | 0.22 | 0.82 | 0.12 | 0.1 |
| 10.600000000000106 | 0.21 | 0.82 | 0.11 | 0.1 |
| 10.616666666666774 | 0.21 | 0.82 | 0.11 | 0.1 |
| 10.633333333333441 | 0.21 | 0.82 | 0.11 | 0.1 |
| 10.650000000000109 | 0.21 | 0.82 | 0.11 | 0.1 |
| 10.666666666666776 | 0.21 | 0.82 | 0.11 | 0.1 |
| 10.683333333333444 | 0.2 | 0.82 | 0.11 | 0.1 |
| 10.700000000000111 | 0.2 | 0.82 | 0.11 | 0.1 |
| 10.716666666666779 | 0.2 | 0.82 | 0.11 | 0.1 |
| 10.733333333333446 | 0.2 | 0.82 | 0.11 | 0.1 |
| 10.750000000000114 | 0.2 | 0.82 | 0.11 | 0.1 |
| 10.766666666666781 | 0.2 | 0.82 | 0.11 | 0.1 |
| 10.783333333333449 | 0.2 | 0.82 | 0.11 | 0.1 |
| 10.800000000000116 | 0.2 | 0.82 | 0.11 | 0.1 |
| 10.816666666666784 | 0.2 | 0.82 | 0.11 | 0.1 |
| 10.833333333333451 | 0.2 | 0.82 | 0.11 | 0.1 |
| 10.850000000000119 | 0.2 | 0.82 | 0.11 | 0.1 |
| 10.866666666666786 | 0.2 | 0.82 | 0.11 | 0.1 |
| 10.883333333333454 | 0.2 | 0.82 | 0.11 | 0.1 |
| 10.900000000000121 | 0.2 | 0.82 | 0.11 | 0.1 |
| 10.916666666666789 | 0.2 | 0.82 | 0.11 | 0.1 |
| 10.933333333333456 | 0.2 | 0.82 | 0.11 | 0.1 |
| 10.950000000000124 | 0.2 | 0.82 | 0.11 | 0.1 |
| 10.966666666666791 | 0.2 | 0.82 | 0.11 | 0.1 |
| 10.983333333333459 | 0.2 | 0.82 | 0.11 | 0.1 |
| 11.000000000000126 | 0.17 | 0.82 | 0.08 | 0.09 |
| 11.016666666666794 | 0.15 | 0.82 | 0.07 | 0.09 |
| 11.033333333333461 | 0.16 | 0.82 | 0.06 | 0.1 |
| 11.050000000000129 | 0.18 | 0.82 | 0.06 | 0.12 |
| 11.066666666666796 | 0.21 | 0.82 | 0.07 | 0.14 |
| 11.083333333333464 | 0.23 | 0.82 | 0.07 | 0.16 |
| 11.100000000000131 | 0.26 | 0.82 | 0.08 | 0.18 |
| 11.116666666666799 | 0.29 | 0.82 | 0.09 | 0.21 |
| 11.133333333333466 | 0.32 | 0.82 | 0.09 | 0.23 |
| 11.150000000000134 | 0.34 | 0.82 | 0.1 | 0.24 |
| 11.166666666666801 | 0.36 | 0.82 | 0.11 | 0.26 |
| 11.183333333333469 | 0.39 | 0.82 | 0.11 | 0.27 |
| 11.200000000000136 | 0.41 | 0.82 | 0.12 | 0.29 |
| 11.216666666666804 | 0.42 | 0.82 | 0.13 | 0.3 |
| 11.233333333333471 | 0.44 | 0.82 | 0.13 | 0.31 |
| 11.250000000000139 | 0.46 | 0.82 | 0.14 | 0.32 |
| 11.266666666666806 | 0.47 | 0.82 | 0.14 | 0.33 |
| 11.283333333333474 | 0.49 | 0.82 | 0.15 | 0.34 |
| 11.300000000000141 | 0.5 | 0.82 | 0.15 | 0.35 |
| 11.316666666666809 | 0.52 | 0.82 | 0.16 | 0.36 |
| 11.333333333333476 | 0.53 | 0.82 | 0.16 | 0.37 |
| 11.350000000000144 | 0.54 | 0.82 | 0.17 | 0.37 |
| 11.366666666666811 | 0.55 | 0.82 | 0.17 | 0.38 |
| 11.383333333333479 | 0.57 | 0.82 | 0.18 | 0.39 |
| 11.400000000000146 | 0.58 | 0.82 | 0.18 | 0.4 |
| 11.416666666666814 | 0.59 | 0.82 | 0.19 | 0.4 |
| 11.433333333333481 | 0.6 | 0.82 | 0.19 | 0.41 |
| 11.450000000000149 | 0.61 | 0.82 | 0.19 | 0.41 |
| 11.466666666666816 | 0.62 | 0.82 | 0.2 | 0.42 |
| 11.483333333333483 | 0.63 | 0.82 | 0.2 | 0.43 |
| 11.500000000000151 | 0.63 | 0.82 | 0.2 | 0.43 |
| 11.516666666666818 | 0.64 | 0.82 | 0.21 | 0.44 |
| 11.533333333333486 | 0.65 | 0.82 | 0.21 | 0.44 |
| 11.550000000000153 | 0.66 | 0.82 | 0.21 | 0.45 |
| 11.566666666666821 | 0.67 | 0.82 | 0.22 | 0.45 |
| 11.583333333333488 | 0.68 | 0.82 | 0.22 | 0.46 |
| 11.600000000000156 | 0.68 | 0.82 | 0.22 | 0.46 |
| 11.616666666666823 | 0.69 | 0.82 | 0.23 | 0.47 |
| 11.633333333333491 | 0.7 | 0.82 | 0.23 | 0.47 |
| 11.650000000000158 | 0.71 | 0.82 | 0.23 | 0.47 |
| 11.666666666666826 | 0.71 | 0.82 | 0.23 | 0.48 |
| 11.683333333333493 | 0.72 | 0.82 | 0.24 | 0.48 |
| 11.700000000000161 | 0.73 | 0.82 | 0.24 | 0.49 |
| 11.716666666666828 | 0.73 | 0.82 | 0.24 | 0.49 |
| 11.733333333333496 | 0.74 | 0.82 | 0.24 | 0.49 |
| 11.750000000000163 | 0.75 | 0.82 | 0.25 | 0.5 |
| 11.766666666666831 | 0.75 | 0.82 | 0.25 | 0.5 |
| 11.783333333333498 | 0.76 | 0.82 | 0.25 | 0.51 |
| 11.800000000000166 | 0.76 | 0.82 | 0.25 | 0.51 |
| 11.816666666666833 | 0.77 | 0.82 | 0.26 | 0.51 |
| 11.833333333333501 | 0.77 | 0.82 | 0.26 | 0.52 |
| 11.850000000000168 | 0.78 | 0.82 | 0.26 | 0.52 |
| 11.866666666666836 | 0.79 | 0.82 | 0.26 | 0.52 |
| 11.883333333333503 | 0.79 | 0.82 | 0.27 | 0.53 |
| 11.90000000000017 | 0.8 | 0.82 | 0.27 | 0.53 |
| 11.916666666666838 | 0.8 | 0.82 | 0.27 | 0.53 |
| 11.933333333333506 | 0.81 | 0.82 | 0.27 | 0.53 |
| 11.950000000000173 | 0.81 | 0.82 | 0.27 | 0.54 |
| 11.96666666666684 | 0.82 | 0.82 | 0.28 | 0.54 |
| 11.983333333333508 | 0.82 | 0.82 | 0.28 | 0.54 |
| 12.000000000000176 | 0.79 | 0.82 | 0.09 | 0.7 |
| 12.016666666666843 | 0.75 | 0.82 | 0 | 0.75 |
| 12.03333333333351 | 0.77 | 0.82 | 0 | 0.77 |
| 12.050000000000178 | 0.79 | 0.82 | 0.02 | 0.78 |
| 12.066666666666846 | 0.77 | 0.82 | 0 | 0.77 |
| 12.083333333333513 | 0.78 | 0.82 | 0.02 | 0.76 |
| 12.10000000000018 | 0.75 | 0.82 | 0 | 0.75 |
| 12.116666666666848 | 0.75 | 0.82 | 0.01 | 0.74 |
| 12.133333333333516 | 0.74 | 0.82 | 0.01 | 0.73 |
| 12.150000000000183 | 0.73 | 0.82 | 0.01 | 0.72 |
| 12.16666666666685 | 0.72 | 0.82 | 0.01 | 0.71 |
| 12.183333333333518 | 0.71 | 0.82 | 0.01 | 0.7 |
| 12.200000000000186 | 0.7 | 0.82 | 0.01 | 0.69 |
| 12.216666666666853 | 0.69 | 0.82 | 0.01 | 0.68 |
| 12.23333333333352 | 0.68 | 0.82 | 0.01 | 0.67 |
| 12.250000000000188 | 0.67 | 0.82 | 0.01 | 0.66 |
| 12.266666666666856 | 0.66 | 0.82 | 0.01 | 0.65 |
| 12.283333333333523 | 0.65 | 0.82 | 0.01 | 0.64 |
| 12.30000000000019 | 0.64 | 0.82 | 0.01 | 0.63 |
| 12.316666666666858 | 0.63 | 0.82 | 0.01 | 0.62 |
| 12.333333333333526 | 0.62 | 0.82 | 0.01 | 0.61 |
| 12.350000000000193 | 0.61 | 0.82 | 0.01 | 0.6 |
| 12.36666666666686 | 0.71 | 0.82 | 0.11 | 0.6 |
| 12.383333333333528 | 0.8 | 0.82 | 0.22 | 0.59 |
| 12.400000000000196 | 0.81 | 0.82 | 0.24 | 0.57 |
| 12.416666666666863 | 0.82 | 0.82 | 0.25 | 0.56 |
| 12.43333333333353 | 0.82 | 0.82 | 0.26 | 0.56 |
| 12.450000000000198 | 0.82 | 0.82 | 0.27 | 0.55 |
| 12.466666666666866 | 0.81 | 0.82 | 0.27 | 0.54 |
| 12.483333333333533 | 0.8 | 0.82 | 0.27 | 0.53 |
| 12.5000000000002 | 0.8 | 0.82 | 0.27 | 0.53 |
| 12.516666666666868 | 0.79 | 0.82 | 0.27 | 0.52 |
| 12.533333333333536 | 0.78 | 0.82 | 0.27 | 0.51 |
| 12.550000000000203 | 0.77 | 0.82 | 0.27 | 0.5 |
| 12.56666666666687 | 0.77 | 0.82 | 0.27 | 0.5 |
| 12.583333333333538 | 0.76 | 0.82 | 0.27 | 0.49 |
| 12.600000000000206 | 0.75 | 0.82 | 0.27 | 0.48 |
| 12.616666666666873 | 0.75 | 0.82 | 0.27 | 0.47 |
| 12.63333333333354 | 0.74 | 0.82 | 0.27 | 0.47 |
| 12.650000000000208 | 0.73 | 0.82 | 0.27 | 0.46 |
| 12.666666666666876 | 0.72 | 0.82 | 0.27 | 0.45 |
| 12.683333333333543 | 0.72 | 0.82 | 0.27 | 0.45 |
| 12.70000000000021 | 0.71 | 0.82 | 0.27 | 0.44 |
| 12.716666666666878 | 0.71 | 0.82 | 0.27 | 0.43 |
| 12.733333333333546 | 0.7 | 0.82 | 0.27 | 0.43 |
| 12.750000000000213 | 0.69 | 0.82 | 0.27 | 0.42 |
| 12.76666666666688 | 0.69 | 0.82 | 0.27 | 0.42 |
| 12.783333333333548 | 0.68 | 0.82 | 0.27 | 0.41 |
| 12.800000000000216 | 0.68 | 0.82 | 0.27 | 0.41 |
| 12.816666666666883 | 0.67 | 0.82 | 0.27 | 0.4 |
| 12.83333333333355 | 0.67 | 0.82 | 0.27 | 0.39 |
| 12.850000000000218 | 0.66 | 0.82 | 0.27 | 0.39 |
| 12.866666666666886 | 0.65 | 0.82 | 0.27 | 0.38 |
| 12.883333333333553 | 0.65 | 0.82 | 0.27 | 0.38 |
| 12.90000000000022 | 0.65 | 0.82 | 0.27 | 0.37 |
| 12.916666666666888 | 0.64 | 0.82 | 0.27 | 0.37 |
| 12.933333333333556 | 0.64 | 0.82 | 0.27 | 0.37 |
| 12.950000000000223 | 0.63 | 0.82 | 0.27 | 0.36 |
| 12.96666666666689 | 0.63 | 0.82 | 0.27 | 0.36 |
| 12.983333333333558 | 0.62 | 0.82 | 0.27 | 0.35 |
| 13.000000000000226 | 0.75 | 0.82 | 0.49 | 0.26 |
| 13.016666666666893 | 0.78 | 0.82 | 0.58 | 0.2 |
| 13.03333333333356 | 0.79 | 0.82 | 0.61 | 0.18 |
| 13.050000000000228 | 0.81 | 0.82 | 0.62 | 0.19 |
| 13.066666666666896 | 0.81 | 0.82 | 0.62 | 0.19 |
| 13.083333333333563 | 0.81 | 0.82 | 0.62 | 0.2 |
| 13.10000000000023 | 0.81 | 0.82 | 0.61 | 0.2 |
| 13.116666666666898 | 0.81 | 0.82 | 0.61 | 0.2 |
| 13.133333333333566 | 0.81 | 0.82 | 0.61 | 0.21 |
| 13.150000000000233 | 0.81 | 0.82 | 0.6 | 0.21 |
| 13.1666666666669 | 0.81 | 0.82 | 0.6 | 0.21 |
| 13.183333333333568 | 0.81 | 0.82 | 0.6 | 0.21 |
| 13.200000000000236 | 0.8 | 0.82 | 0.59 | 0.21 |
| 13.216666666666903 | 0.8 | 0.82 | 0.59 | 0.21 |
| 13.23333333333357 | 0.8 | 0.82 | 0.59 | 0.21 |
| 13.250000000000238 | 0.8 | 0.82 | 0.59 | 0.21 |
| 13.266666666666906 | 0.79 | 0.82 | 0.58 | 0.21 |
| 13.283333333333573 | 0.79 | 0.82 | 0.58 | 0.21 |
| 13.30000000000024 | 0.79 | 0.82 | 0.58 | 0.21 |
| 13.316666666666908 | 0.79 | 0.82 | 0.57 | 0.21 |
| 13.333333333333576 | 0.79 | 0.82 | 0.57 | 0.22 |
| 13.350000000000243 | 0.78 | 0.82 | 0.57 | 0.22 |
| 13.36666666666691 | 0.78 | 0.82 | 0.56 | 0.22 |
| 13.383333333333578 | 0.78 | 0.82 | 0.56 | 0.22 |
| 13.400000000000245 | 0.78 | 0.82 | 0.56 | 0.22 |
| 13.416666666666913 | 0.77 | 0.82 | 0.56 | 0.22 |
| 13.43333333333358 | 0.77 | 0.82 | 0.55 | 0.22 |
| 13.450000000000248 | 0.77 | 0.82 | 0.55 | 0.22 |
| 13.466666666666915 | 0.77 | 0.82 | 0.55 | 0.22 |
| 13.483333333333583 | 0.76 | 0.82 | 0.54 | 0.22 |
| 13.50000000000025 | 0.76 | 0.82 | 0.54 | 0.22 |
| 13.516666666666918 | 0.76 | 0.82 | 0.54 | 0.22 |
| 13.533333333333585 | 0.76 | 0.82 | 0.53 | 0.22 |
| 13.550000000000253 | 0.75 | 0.82 | 0.53 | 0.22 |
| 13.56666666666692 | 0.75 | 0.82 | 0.53 | 0.22 |
| 13.583333333333588 | 0.75 | 0.82 | 0.53 | 0.22 |
| 13.600000000000255 | 0.75 | 0.82 | 0.52 | 0.22 |
| 13.616666666666923 | 0.74 | 0.82 | 0.52 | 0.22 |
| 13.63333333333359 | 0.74 | 0.82 | 0.52 | 0.22 |
| 13.650000000000258 | 0.74 | 0.82 | 0.51 | 0.22 |
| 13.666666666666925 | 0.74 | 0.82 | 0.51 | 0.22 |
| 13.683333333333593 | 0.73 | 0.82 | 0.51 | 0.23 |
| 13.70000000000026 | 0.73 | 0.82 | 0.51 | 0.23 |
| 13.716666666666928 | 0.73 | 0.82 | 0.5 | 0.23 |
| 13.733333333333595 | 0.73 | 0.82 | 0.5 | 0.23 |
| 13.750000000000263 | 0.72 | 0.82 | 0.5 | 0.23 |
| 13.76666666666693 | 0.72 | 0.82 | 0.5 | 0.23 |
| 13.783333333333598 | 0.72 | 0.82 | 0.49 | 0.23 |
| 13.800000000000265 | 0.72 | 0.82 | 0.49 | 0.23 |
| 13.816666666666933 | 0.72 | 0.82 | 0.49 | 0.23 |
| 13.8333333333336 | 0.71 | 0.82 | 0.48 | 0.23 |
| 13.850000000000268 | 0.71 | 0.82 | 0.48 | 0.23 |
| 13.866666666666935 | 0.71 | 0.82 | 0.48 | 0.23 |
| 13.883333333333603 | 0.71 | 0.82 | 0.48 | 0.23 |
| 13.90000000000027 | 0.7 | 0.82 | 0.47 | 0.23 |
| 13.916666666666938 | 0.7 | 0.82 | 0.47 | 0.23 |
| 13.933333333333605 | 0.7 | 0.82 | 0.47 | 0.23 |
| 13.950000000000273 | 0.7 | 0.82 | 0.47 | 0.23 |
| 13.96666666666694 | 0.69 | 0.82 | 0.46 | 0.23 |
| 13.983333333333608 | 0.69 | 0.82 | 0.46 | 0.23 |
| 14.000000000000275 | 0.75 | 0.82 | 0.59 | 0.17 |
| 14.016666666666943 | 0.76 | 0.82 | 0.62 | 0.14 |
| 14.03333333333361 | 0.77 | 0.82 | 0.65 | 0.12 |
| 14.050000000000278 | 0.79 | 0.82 | 0.66 | 0.13 |
| 14.066666666666945 | 0.8 | 0.82 | 0.66 | 0.14 |
| 14.083333333333613 | 0.8 | 0.82 | 0.66 | 0.14 |
| 14.10000000000028 | 0.8 | 0.82 | 0.66 | 0.15 |
| 14.116666666666948 | 0.8 | 0.82 | 0.65 | 0.15 |
| 14.133333333333615 | 0.8 | 0.82 | 0.65 | 0.16 |
| 14.150000000000283 | 0.8 | 0.82 | 0.64 | 0.16 |
| 14.16666666666695 | 0.8 | 0.82 | 0.64 | 0.16 |
| 14.183333333333618 | 0.8 | 0.82 | 0.64 | 0.17 |
| 14.200000000000285 | 0.8 | 0.82 | 0.63 | 0.17 |
| 14.216666666666953 | 0.8 | 0.82 | 0.63 | 0.17 |
| 14.23333333333362 | 0.8 | 0.82 | 0.63 | 0.17 |
| 14.250000000000288 | 0.8 | 0.82 | 0.62 | 0.18 |
| 14.266666666666955 | 0.8 | 0.82 | 0.62 | 0.18 |
| 14.283333333333623 | 0.8 | 0.82 | 0.62 | 0.18 |
| 14.30000000000029 | 0.8 | 0.82 | 0.61 | 0.19 |
| 14.316666666666958 | 0.8 | 0.82 | 0.61 | 0.19 |
| 14.333333333333625 | 0.8 | 0.82 | 0.61 | 0.19 |
| 14.350000000000293 | 0.8 | 0.82 | 0.6 | 0.19 |
| 14.36666666666696 | 0.79 | 0.82 | 0.6 | 0.19 |
| 14.383333333333628 | 0.79 | 0.82 | 0.6 | 0.2 |
| 14.400000000000295 | 0.79 | 0.82 | 0.59 | 0.2 |
| 14.416666666666963 | 0.79 | 0.82 | 0.59 | 0.2 |
| 14.43333333333363 | 0.79 | 0.82 | 0.59 | 0.2 |
| 14.450000000000298 | 0.79 | 0.82 | 0.58 | 0.2 |
| 14.466666666666965 | 0.79 | 0.82 | 0.58 | 0.21 |
| 14.483333333333633 | 0.79 | 0.82 | 0.58 | 0.21 |
| 14.5000000000003 | 0.79 | 0.82 | 0.58 | 0.21 |
| 14.516666666666968 | 0.79 | 0.82 | 0.57 | 0.21 |
| 14.533333333333635 | 0.79 | 0.82 | 0.57 | 0.21 |
| 14.550000000000303 | 0.78 | 0.82 | 0.57 | 0.22 |
| 14.56666666666697 | 0.78 | 0.82 | 0.57 | 0.22 |
| 14.583333333333638 | 0.78 | 0.82 | 0.56 | 0.22 |
| 14.600000000000305 | 0.78 | 0.82 | 0.56 | 0.22 |
| 14.616666666666973 | 0.78 | 0.82 | 0.56 | 0.22 |
| 14.63333333333364 | 0.78 | 0.82 | 0.56 | 0.22 |
| 14.650000000000308 | 0.78 | 0.82 | 0.55 | 0.23 |
| 14.666666666666975 | 0.78 | 0.82 | 0.55 | 0.23 |
| 14.683333333333643 | 0.78 | 0.82 | 0.55 | 0.23 |
| 14.70000000000031 | 0.78 | 0.82 | 0.55 | 0.23 |
| 14.716666666666978 | 0.78 | 0.82 | 0.54 | 0.23 |
| 14.733333333333645 | 0.78 | 0.82 | 0.54 | 0.23 |
| 14.750000000000313 | 0.78 | 0.82 | 0.54 | 0.24 |
| 14.76666666666698 | 0.77 | 0.82 | 0.54 | 0.24 |
| 14.783333333333648 | 0.77 | 0.82 | 0.54 | 0.24 |
| 14.800000000000315 | 0.77 | 0.82 | 0.53 | 0.24 |
| 14.816666666666983 | 0.77 | 0.82 | 0.53 | 0.24 |
| 14.83333333333365 | 0.77 | 0.82 | 0.53 | 0.24 |
| 14.850000000000318 | 0.77 | 0.82 | 0.53 | 0.24 |
| 14.866666666666985 | 0.77 | 0.82 | 0.53 | 0.25 |
| 14.883333333333653 | 0.77 | 0.82 | 0.52 | 0.25 |
| 14.90000000000032 | 0.77 | 0.82 | 0.52 | 0.25 |
| 14.916666666666988 | 0.77 | 0.82 | 0.52 | 0.25 |
| 14.933333333333655 | 0.77 | 0.82 | 0.52 | 0.25 |
| 14.950000000000323 | 0.77 | 0.82 | 0.52 | 0.25 |
| 14.96666666666699 | 0.77 | 0.82 | 0.51 | 0.25 |
| 14.983333333333658 | 0.77 | 0.82 | 0.51 | 0.26 |
| 15.000000000000325 | 0.76 | 0.82 | 0.45 | 0.31 |
| 15.016666666666993 | 0.76 | 0.82 | 0.44 | 0.32 |
| 15.03333333333366 | 0.76 | 0.82 | 0.44 | 0.32 |
| 15.050000000000328 | 0.76 | 0.82 | 0.44 | 0.32 |
| 15.066666666666995 | 0.76 | 0.82 | 0.44 | 0.32 |
| 15.083333333333663 | 0.76 | 0.82 | 0.44 | 0.32 |
| 15.10000000000033 | 0.76 | 0.82 | 0.44 | 0.32 |
| 15.116666666666998 | 0.76 | 0.82 | 0.44 | 0.32 |
| 15.133333333333665 | 0.76 | 0.82 | 0.44 | 0.32 |
| 15.150000000000333 | 0.76 | 0.82 | 0.44 | 0.32 |
| 15.166666666667 | 0.76 | 0.82 | 0.44 | 0.32 |
| 15.183333333333668 | 0.76 | 0.82 | 0.44 | 0.32 |
| 15.200000000000335 | 0.76 | 0.82 | 0.44 | 0.32 |
| 15.216666666667003 | 0.76 | 0.82 | 0.44 | 0.32 |
| 15.23333333333367 | 0.76 | 0.82 | 0.44 | 0.32 |
| 15.250000000000338 | 0.76 | 0.82 | 0.44 | 0.32 |
| 15.266666666667005 | 0.76 | 0.82 | 0.44 | 0.32 |
| 15.283333333333672 | 0.76 | 0.82 | 0.44 | 0.32 |
| 15.30000000000034 | 0.76 | 0.82 | 0.44 | 0.32 |
| 15.316666666667007 | 0.76 | 0.82 | 0.44 | 0.32 |
| 15.333333333333675 | 0.76 | 0.82 | 0.44 | 0.32 |
| 15.350000000000342 | 0.76 | 0.82 | 0.44 | 0.32 |
| 15.36666666666701 | 0.76 | 0.82 | 0.44 | 0.32 |
| 15.383333333333677 | 0.76 | 0.82 | 0.44 | 0.32 |
| 15.400000000000345 | 0.76 | 0.82 | 0.44 | 0.32 |
| 15.416666666667012 | 0.76 | 0.82 | 0.44 | 0.32 |
| 15.43333333333368 | 0.76 | 0.82 | 0.44 | 0.32 |
| 15.450000000000347 | 0.76 | 0.82 | 0.44 | 0.32 |
| 15.466666666667015 | 0.76 | 0.82 | 0.44 | 0.32 |
| 15.483333333333682 | 0.76 | 0.82 | 0.44 | 0.32 |
| 15.50000000000035 | 0.76 | 0.82 | 0.44 | 0.32 |
| 15.516666666667017 | 0.76 | 0.82 | 0.44 | 0.32 |
| 15.533333333333685 | 0.76 | 0.82 | 0.44 | 0.32 |
| 15.550000000000352 | 0.76 | 0.82 | 0.44 | 0.32 |
| 15.56666666666702 | 0.76 | 0.82 | 0.44 | 0.32 |
| 15.583333333333687 | 0.76 | 0.82 | 0.44 | 0.32 |
| 15.600000000000355 | 0.76 | 0.82 | 0.44 | 0.32 |
| 15.616666666667022 | 0.76 | 0.82 | 0.44 | 0.32 |
| 15.63333333333369 | 0.76 | 0.82 | 0.44 | 0.32 |
| 15.650000000000357 | 0.76 | 0.82 | 0.44 | 0.32 |
| 15.666666666667025 | 0.76 | 0.82 | 0.44 | 0.32 |
| 15.683333333333692 | 0.76 | 0.82 | 0.44 | 0.32 |
| 15.70000000000036 | 0.76 | 0.82 | 0.44 | 0.32 |
| 15.716666666667027 | 0.76 | 0.82 | 0.44 | 0.32 |
| 15.733333333333695 | 0.76 | 0.82 | 0.44 | 0.32 |
| 15.750000000000362 | 0.76 | 0.82 | 0.44 | 0.32 |
| 15.76666666666703 | 0.76 | 0.82 | 0.44 | 0.32 |
| 15.783333333333697 | 0.76 | 0.82 | 0.44 | 0.32 |
| 15.800000000000365 | 0.76 | 0.82 | 0.44 | 0.32 |
| 15.816666666667032 | 0.76 | 0.82 | 0.44 | 0.32 |
| 15.8333333333337 | 0.76 | 0.82 | 0.44 | 0.32 |
| 15.850000000000367 | 0.76 | 0.82 | 0.44 | 0.32 |
| 15.866666666667035 | 0.76 | 0.82 | 0.44 | 0.32 |
| 15.883333333333702 | 0.76 | 0.82 | 0.44 | 0.32 |
| 15.90000000000037 | 0.76 | 0.82 | 0.44 | 0.32 |
| 15.916666666667037 | 0.76 | 0.82 | 0.44 | 0.32 |
| 15.933333333333705 | 0.76 | 0.82 | 0.44 | 0.32 |
| 15.950000000000372 | 0.76 | 0.82 | 0.44 | 0.32 |
| 15.96666666666704 | 0.76 | 0.82 | 0.44 | 0.32 |
| 15.983333333333707 | 0.76 | 0.82 | 0.44 | 0.32 |
| 16.000000000000373 | 0.73 | 0.82 | 0.47 | 0.26 |
| 16.01666666666704 | 0.7 | 0.82 | 0.49 | 0.21 |
| 16.033333333333704 | 0.69 | 0.82 | 0.5 | 0.2 |
| 16.05000000000037 | 0.69 | 0.82 | 0.5 | 0.19 |
| 16.066666666667036 | 0.69 | 0.82 | 0.5 | 0.19 |
| 16.0833333333337 | 0.69 | 0.82 | 0.5 | 0.19 |
| 16.100000000000367 | 0.69 | 0.82 | 0.5 | 0.19 |
| 16.116666666667033 | 0.69 | 0.82 | 0.5 | 0.19 |
| 16.1333333333337 | 0.69 | 0.82 | 0.5 | 0.19 |
| 16.150000000000365 | 0.69 | 0.82 | 0.5 | 0.19 |
| 16.16666666666703 | 0.69 | 0.82 | 0.5 | 0.19 |
| 16.183333333333696 | 0.69 | 0.82 | 0.5 | 0.19 |
| 16.20000000000036 | 0.69 | 0.82 | 0.5 | 0.19 |
| 16.216666666667027 | 0.69 | 0.82 | 0.5 | 0.19 |
| 16.233333333333693 | 0.69 | 0.82 | 0.5 | 0.19 |
| 16.25000000000036 | 0.69 | 0.82 | 0.5 | 0.19 |
| 16.266666666667025 | 0.69 | 0.82 | 0.5 | 0.19 |
| 16.28333333333369 | 0.69 | 0.82 | 0.5 | 0.19 |
| 16.300000000000356 | 0.69 | 0.82 | 0.5 | 0.19 |
| 16.31666666666702 | 0.69 | 0.82 | 0.5 | 0.19 |
| 16.333333333333687 | 0.69 | 0.82 | 0.5 | 0.19 |
| 16.350000000000353 | 0.69 | 0.82 | 0.5 | 0.19 |
| 16.36666666666702 | 0.69 | 0.82 | 0.5 | 0.19 |
| 16.383333333333685 | 0.69 | 0.82 | 0.5 | 0.19 |
| 16.40000000000035 | 0.69 | 0.82 | 0.5 | 0.19 |
| 16.416666666667016 | 0.69 | 0.82 | 0.5 | 0.19 |
| 16.43333333333368 | 0.69 | 0.82 | 0.5 | 0.19 |
| 16.450000000000347 | 0.69 | 0.82 | 0.5 | 0.19 |
| 16.466666666667013 | 0.69 | 0.82 | 0.5 | 0.19 |
| 16.48333333333368 | 0.69 | 0.82 | 0.5 | 0.19 |
| 16.500000000000345 | 0.69 | 0.82 | 0.5 | 0.19 |
| 16.51666666666701 | 0.69 | 0.82 | 0.5 | 0.19 |
| 16.533333333333676 | 0.69 | 0.82 | 0.5 | 0.19 |
| 16.55000000000034 | 0.69 | 0.82 | 0.5 | 0.19 |
| 16.566666666667007 | 0.69 | 0.82 | 0.5 | 0.19 |
| 16.583333333333673 | 0.69 | 0.82 | 0.5 | 0.19 |
| 16.60000000000034 | 0.69 | 0.82 | 0.5 | 0.19 |
| 16.616666666667005 | 0.69 | 0.82 | 0.5 | 0.19 |
| 16.63333333333367 | 0.69 | 0.82 | 0.5 | 0.19 |
| 16.650000000000336 | 0.69 | 0.82 | 0.5 | 0.19 |
| 16.666666666667002 | 0.69 | 0.82 | 0.5 | 0.19 |
| 16.683333333333668 | 0.69 | 0.82 | 0.5 | 0.19 |
| 16.700000000000333 | 0.69 | 0.82 | 0.5 | 0.19 |
| 16.716666666667 | 0.69 | 0.82 | 0.5 | 0.19 |
| 16.733333333333665 | 0.69 | 0.82 | 0.5 | 0.19 |
| 16.75000000000033 | 0.69 | 0.82 | 0.5 | 0.19 |
| 16.766666666666996 | 0.69 | 0.82 | 0.5 | 0.19 |
| 16.783333333333662 | 0.69 | 0.82 | 0.5 | 0.19 |
| 16.800000000000328 | 0.69 | 0.82 | 0.5 | 0.19 |
| 16.816666666666993 | 0.69 | 0.82 | 0.5 | 0.19 |
| 16.83333333333366 | 0.69 | 0.82 | 0.5 | 0.19 |
| 16.850000000000325 | 0.69 | 0.82 | 0.5 | 0.19 |
| 16.86666666666699 | 0.69 | 0.82 | 0.5 | 0.19 |
| 16.883333333333656 | 0.69 | 0.82 | 0.5 | 0.19 |
| 16.900000000000322 | 0.69 | 0.82 | 0.5 | 0.19 |
| 16.916666666666988 | 0.69 | 0.82 | 0.5 | 0.19 |
| 16.933333333333653 | 0.69 | 0.82 | 0.5 | 0.19 |
| 16.95000000000032 | 0.69 | 0.82 | 0.5 | 0.19 |
| 16.966666666666985 | 0.69 | 0.82 | 0.5 | 0.19 |
| 16.98333333333365 | 0.69 | 0.82 | 0.5 | 0.19 |
| 17.000000000000316 | 0.76 | 0.82 | 0.47 | 0.29 |
| 17.016666666666982 | 0.78 | 0.82 | 0.44 | 0.34 |
| 17.033333333333648 | 0.79 | 0.82 | 0.43 | 0.36 |
| 17.050000000000313 | 0.79 | 0.82 | 0.43 | 0.36 |
| 17.06666666666698 | 0.79 | 0.82 | 0.42 | 0.37 |
| 17.083333333333645 | 0.79 | 0.82 | 0.42 | 0.37 |
| 17.10000000000031 | 0.78 | 0.82 | 0.42 | 0.36 |
| 17.116666666666976 | 0.78 | 0.82 | 0.41 | 0.36 |
| 17.133333333333642 | 0.77 | 0.82 | 0.41 | 0.36 |
| 17.150000000000308 | 0.77 | 0.82 | 0.41 | 0.36 |
| 17.166666666666973 | 0.76 | 0.82 | 0.4 | 0.36 |
| 17.18333333333364 | 0.76 | 0.82 | 0.4 | 0.36 |
| 17.200000000000305 | 0.75 | 0.82 | 0.39 | 0.36 |
| 17.21666666666697 | 0.74 | 0.82 | 0.39 | 0.36 |
| 17.233333333333636 | 0.74 | 0.82 | 0.39 | 0.35 |
| 17.250000000000302 | 0.73 | 0.82 | 0.38 | 0.35 |
| 17.266666666666968 | 0.73 | 0.82 | 0.38 | 0.35 |
| 17.283333333333633 | 0.72 | 0.82 | 0.37 | 0.35 |
| 17.3000000000003 | 0.72 | 0.82 | 0.37 | 0.35 |
| 17.316666666666965 | 0.71 | 0.82 | 0.37 | 0.35 |
| 17.33333333333363 | 0.71 | 0.82 | 0.36 | 0.35 |
| 17.350000000000296 | 0.7 | 0.82 | 0.36 | 0.34 |
| 17.366666666666962 | 0.7 | 0.82 | 0.36 | 0.34 |
| 17.383333333333628 | 0.69 | 0.82 | 0.35 | 0.34 |
| 17.400000000000293 | 0.69 | 0.82 | 0.35 | 0.34 |
| 17.41666666666696 | 0.68 | 0.82 | 0.35 | 0.34 |
| 17.433333333333625 | 0.68 | 0.82 | 0.34 | 0.34 |
| 17.45000000000029 | 0.67 | 0.82 | 0.34 | 0.34 |
| 17.466666666666956 | 0.67 | 0.82 | 0.34 | 0.33 |
| 17.483333333333622 | 0.67 | 0.82 | 0.33 | 0.33 |
| 17.500000000000288 | 0.66 | 0.82 | 0.33 | 0.33 |
| 17.516666666666953 | 0.66 | 0.82 | 0.33 | 0.33 |
| 17.53333333333362 | 0.65 | 0.82 | 0.32 | 0.33 |
| 17.550000000000285 | 0.65 | 0.82 | 0.32 | 0.33 |
| 17.56666666666695 | 0.64 | 0.82 | 0.32 | 0.33 |
| 17.583333333333616 | 0.64 | 0.82 | 0.31 | 0.33 |
| 17.600000000000282 | 0.64 | 0.82 | 0.31 | 0.32 |
| 17.616666666666948 | 0.63 | 0.82 | 0.31 | 0.32 |
| 17.633333333333614 | 0.63 | 0.82 | 0.31 | 0.32 |
| 17.65000000000028 | 0.62 | 0.82 | 0.3 | 0.32 |
| 17.666666666666945 | 0.62 | 0.82 | 0.3 | 0.32 |
| 17.68333333333361 | 0.62 | 0.82 | 0.3 | 0.32 |
| 17.700000000000276 | 0.61 | 0.82 | 0.3 | 0.32 |
| 17.716666666666942 | 0.61 | 0.82 | 0.29 | 0.32 |
| 17.733333333333608 | 0.61 | 0.82 | 0.29 | 0.31 |
| 17.750000000000274 | 0.6 | 0.82 | 0.29 | 0.31 |
| 17.76666666666694 | 0.6 | 0.82 | 0.29 | 0.31 |
| 17.783333333333605 | 0.59 | 0.82 | 0.28 | 0.31 |
| 17.80000000000027 | 0.59 | 0.82 | 0.28 | 0.31 |
| 17.816666666666936 | 0.59 | 0.82 | 0.28 | 0.31 |
| 17.833333333333602 | 0.59 | 0.82 | 0.28 | 0.31 |
| 17.850000000000268 | 0.58 | 0.82 | 0.28 | 0.31 |
| 17.866666666666934 | 0.58 | 0.82 | 0.27 | 0.31 |
| 17.8833333333336 | 0.58 | 0.82 | 0.27 | 0.3 |
| 17.900000000000265 | 0.57 | 0.82 | 0.27 | 0.3 |
| 17.91666666666693 | 0.57 | 0.82 | 0.27 | 0.3 |
| 17.933333333333596 | 0.57 | 0.82 | 0.27 | 0.3 |
| 17.950000000000262 | 0.56 | 0.82 | 0.26 | 0.3 |
| 17.966666666666928 | 0.56 | 0.82 | 0.26 | 0.3 |
| 17.983333333333594 | 0.56 | 0.82 | 0.26 | 0.3 |
| 18.00000000000026 | 0.7 | 0.82 | 0.23 | 0.47 |
| 18.016666666666925 | 0.75 | 0.82 | 0.2 | 0.55 |
| 18.03333333333359 | 0.77 | 0.82 | 0.19 | 0.57 |
| 18.050000000000257 | 0.78 | 0.82 | 0.2 | 0.58 |
| 18.066666666666922 | 0.78 | 0.82 | 0.21 | 0.57 |
| 18.083333333333588 | 0.78 | 0.82 | 0.21 | 0.57 |
| 18.100000000000254 | 0.77 | 0.82 | 0.22 | 0.56 |
| 18.11666666666692 | 0.77 | 0.82 | 0.22 | 0.55 |
| 18.133333333333585 | 0.76 | 0.82 | 0.22 | 0.54 |
| 18.15000000000025 | 0.75 | 0.82 | 0.22 | 0.53 |
| 18.166666666666917 | 0.74 | 0.82 | 0.22 | 0.52 |
| 18.183333333333582 | 0.74 | 0.82 | 0.22 | 0.51 |
| 18.200000000000248 | 0.73 | 0.82 | 0.22 | 0.5 |
| 18.216666666666914 | 0.72 | 0.82 | 0.22 | 0.5 |
| 18.23333333333358 | 0.71 | 0.82 | 0.22 | 0.49 |
| 18.250000000000245 | 0.7 | 0.82 | 0.22 | 0.48 |
| 18.26666666666691 | 0.69 | 0.82 | 0.22 | 0.47 |
| 18.283333333333577 | 0.69 | 0.82 | 0.22 | 0.46 |
| 18.300000000000242 | 0.68 | 0.82 | 0.22 | 0.46 |
| 18.316666666666908 | 0.67 | 0.82 | 0.22 | 0.45 |
| 18.333333333333574 | 0.66 | 0.82 | 0.22 | 0.44 |
| 18.35000000000024 | 0.66 | 0.82 | 0.22 | 0.43 |
| 18.366666666666905 | 0.65 | 0.82 | 0.22 | 0.43 |
| 18.38333333333357 | 0.64 | 0.82 | 0.22 | 0.42 |
| 18.400000000000237 | 0.64 | 0.82 | 0.22 | 0.41 |
| 18.416666666666902 | 0.63 | 0.82 | 0.22 | 0.4 |
| 18.433333333333568 | 0.62 | 0.82 | 0.22 | 0.4 |
| 18.450000000000234 | 0.62 | 0.82 | 0.22 | 0.39 |
| 18.4666666666669 | 0.61 | 0.82 | 0.22 | 0.38 |
| 18.483333333333565 | 0.6 | 0.82 | 0.22 | 0.38 |
| 18.50000000000023 | 0.6 | 0.82 | 0.22 | 0.37 |
| 18.516666666666897 | 0.59 | 0.82 | 0.22 | 0.37 |
| 18.533333333333562 | 0.58 | 0.82 | 0.22 | 0.36 |
| 18.550000000000228 | 0.58 | 0.82 | 0.22 | 0.35 |
| 18.566666666666894 | 0.57 | 0.82 | 0.22 | 0.35 |
| 18.58333333333356 | 0.57 | 0.82 | 0.22 | 0.34 |
| 18.600000000000225 | 0.56 | 0.82 | 0.22 | 0.34 |
| 18.61666666666689 | 0.56 | 0.82 | 0.22 | 0.33 |
| 18.633333333333557 | 0.55 | 0.82 | 0.22 | 0.33 |
| 18.650000000000222 | 0.55 | 0.82 | 0.22 | 0.32 |
| 18.666666666666888 | 0.54 | 0.82 | 0.22 | 0.32 |
| 18.683333333333554 | 0.54 | 0.82 | 0.22 | 0.31 |
| 18.70000000000022 | 0.53 | 0.82 | 0.22 | 0.31 |
| 18.716666666666885 | 0.53 | 0.82 | 0.22 | 0.31 |
| 18.73333333333355 | 0.53 | 0.82 | 0.22 | 0.3 |
| 18.750000000000217 | 0.52 | 0.82 | 0.22 | 0.3 |
| 18.766666666666882 | 0.52 | 0.82 | 0.22 | 0.29 |
| 18.783333333333548 | 0.52 | 0.82 | 0.22 | 0.29 |
| 18.800000000000214 | 0.51 | 0.82 | 0.22 | 0.29 |
| 18.81666666666688 | 0.51 | 0.82 | 0.22 | 0.28 |
| 18.833333333333545 | 0.51 | 0.82 | 0.22 | 0.28 |
| 18.85000000000021 | 0.5 | 0.82 | 0.22 | 0.28 |
| 18.866666666666877 | 0.5 | 0.82 | 0.22 | 0.28 |
| 18.883333333333542 | 0.5 | 0.82 | 0.22 | 0.27 |
| 18.900000000000208 | 0.5 | 0.82 | 0.22 | 0.27 |
| 18.916666666666874 | 0.49 | 0.82 | 0.22 | 0.27 |
| 18.93333333333354 | 0.49 | 0.82 | 0.22 | 0.27 |
| 18.950000000000205 | 0.49 | 0.82 | 0.22 | 0.26 |
| 18.96666666666687 | 0.49 | 0.82 | 0.22 | 0.26 |
| 18.983333333333537 | 0.48 | 0.82 | 0.22 | 0.26 |
| 19.000000000000203 | 0.49 | 0.82 | 0.23 | 0.26 |
| 19.01666666666687 | 0.51 | 0.82 | 0.24 | 0.27 |
| 19.033333333333534 | 0.52 | 0.82 | 0.25 | 0.27 |
| 19.0500000000002 | 0.53 | 0.82 | 0.26 | 0.27 |
| 19.066666666666865 | 0.53 | 0.82 | 0.26 | 0.28 |
| 19.08333333333353 | 0.54 | 0.82 | 0.26 | 0.28 |
| 19.100000000000197 | 0.54 | 0.82 | 0.26 | 0.28 |
| 19.116666666666863 | 0.55 | 0.82 | 0.26 | 0.28 |
| 19.13333333333353 | 0.55 | 0.82 | 0.27 | 0.29 |
| 19.150000000000194 | 0.56 | 0.82 | 0.27 | 0.29 |
| 19.16666666666686 | 0.56 | 0.82 | 0.27 | 0.29 |
| 19.183333333333525 | 0.57 | 0.82 | 0.27 | 0.29 |
| 19.20000000000019 | 0.57 | 0.82 | 0.27 | 0.3 |
| 19.216666666666857 | 0.57 | 0.82 | 0.27 | 0.3 |
| 19.233333333333523 | 0.58 | 0.82 | 0.28 | 0.3 |
| 19.25000000000019 | 0.58 | 0.82 | 0.28 | 0.3 |
| 19.266666666666854 | 0.58 | 0.82 | 0.28 | 0.3 |
| 19.28333333333352 | 0.58 | 0.82 | 0.28 | 0.3 |
| 19.300000000000185 | 0.59 | 0.82 | 0.28 | 0.3 |
| 19.31666666666685 | 0.59 | 0.82 | 0.28 | 0.31 |
| 19.333333333333517 | 0.59 | 0.82 | 0.28 | 0.31 |
| 19.350000000000183 | 0.59 | 0.82 | 0.29 | 0.31 |
| 19.36666666666685 | 0.59 | 0.82 | 0.29 | 0.31 |
| 19.383333333333514 | 0.6 | 0.82 | 0.29 | 0.31 |
| 19.40000000000018 | 0.6 | 0.82 | 0.29 | 0.31 |
| 19.416666666666845 | 0.6 | 0.82 | 0.29 | 0.31 |
| 19.43333333333351 | 0.6 | 0.82 | 0.29 | 0.31 |
| 19.450000000000177 | 0.6 | 0.82 | 0.29 | 0.31 |
| 19.466666666666843 | 0.61 | 0.82 | 0.29 | 0.31 |
| 19.48333333333351 | 0.61 | 0.82 | 0.29 | 0.31 |
| 19.500000000000174 | 0.61 | 0.82 | 0.29 | 0.31 |
| 19.51666666666684 | 0.61 | 0.82 | 0.3 | 0.32 |
| 19.533333333333506 | 0.61 | 0.82 | 0.3 | 0.32 |
| 19.55000000000017 | 0.61 | 0.82 | 0.3 | 0.32 |
| 19.566666666666837 | 0.61 | 0.82 | 0.3 | 0.32 |
| 19.583333333333503 | 0.62 | 0.82 | 0.3 | 0.32 |
| 19.60000000000017 | 0.62 | 0.82 | 0.3 | 0.32 |
| 19.616666666666834 | 0.62 | 0.82 | 0.3 | 0.32 |
| 19.6333333333335 | 0.62 | 0.82 | 0.3 | 0.32 |
| 19.650000000000166 | 0.62 | 0.82 | 0.3 | 0.32 |
| 19.66666666666683 | 0.62 | 0.82 | 0.3 | 0.32 |
| 19.683333333333497 | 0.62 | 0.82 | 0.3 | 0.32 |
| 19.700000000000163 | 0.62 | 0.82 | 0.3 | 0.32 |
| 19.71666666666683 | 0.62 | 0.82 | 0.3 | 0.32 |
| 19.733333333333494 | 0.62 | 0.82 | 0.3 | 0.32 |
| 19.75000000000016 | 0.62 | 0.82 | 0.3 | 0.32 |
| 19.766666666666826 | 0.62 | 0.82 | 0.3 | 0.32 |
| 19.78333333333349 | 0.62 | 0.82 | 0.3 | 0.32 |
| 19.800000000000157 | 0.62 | 0.82 | 0.3 | 0.32 |
| 19.816666666666823 | 0.62 | 0.82 | 0.3 | 0.32 |
| 19.83333333333349 | 0.62 | 0.82 | 0.3 | 0.32 |
| 19.850000000000154 | 0.62 | 0.82 | 0.3 | 0.32 |
| 19.86666666666682 | 0.62 | 0.82 | 0.3 | 0.32 |
| 19.883333333333486 | 0.62 | 0.82 | 0.3 | 0.32 |
| 19.90000000000015 | 0.62 | 0.82 | 0.3 | 0.32 |
| 19.916666666666817 | 0.62 | 0.82 | 0.3 | 0.32 |
| 19.933333333333483 | 0.62 | 0.82 | 0.3 | 0.32 |
| 19.95000000000015 | 0.62 | 0.82 | 0.3 | 0.32 |
| 19.966666666666814 | 0.62 | 0.82 | 0.3 | 0.32 |
| 19.98333333333348 | 0.62 | 0.82 | 0.3 | 0.32 |
| 20.000000000000146 | 0.48 | 0.82 | 0.29 | 0.19 |
| 20.01666666666681 | 0.43 | 0.82 | 0.29 | 0.14 |
| 20.033333333333477 | 0.41 | 0.82 | 0.29 | 0.12 |
| 20.050000000000143 | 0.4 | 0.82 | 0.29 | 0.11 |
| 20.06666666666681 | 0.4 | 0.82 | 0.3 | 0.1 |
| 20.083333333333474 | 0.4 | 0.82 | 0.3 | 0.1 |
| 20.10000000000014 | 0.41 | 0.82 | 0.31 | 0.1 |
| 20.116666666666806 | 0.42 | 0.82 | 0.32 | 0.1 |
| 20.13333333333347 | 0.43 | 0.82 | 0.32 | 0.11 |
| 20.150000000000137 | 0.44 | 0.82 | 0.33 | 0.11 |
| 20.166666666666803 | 0.45 | 0.82 | 0.34 | 0.11 |
| 20.18333333333347 | 0.46 | 0.82 | 0.35 | 0.12 |
| 20.200000000000134 | 0.47 | 0.82 | 0.35 | 0.12 |
| 20.2166666666668 | 0.48 | 0.82 | 0.36 | 0.12 |
| 20.233333333333466 | 0.49 | 0.82 | 0.36 | 0.13 |
| 20.25000000000013 | 0.5 | 0.82 | 0.37 | 0.13 |
| 20.266666666666797 | 0.51 | 0.82 | 0.38 | 0.14 |
| 20.283333333333463 | 0.52 | 0.82 | 0.38 | 0.14 |
| 20.30000000000013 | 0.53 | 0.82 | 0.39 | 0.14 |
| 20.316666666666794 | 0.54 | 0.82 | 0.39 | 0.15 |
| 20.33333333333346 | 0.55 | 0.82 | 0.4 | 0.15 |
| 20.350000000000126 | 0.55 | 0.82 | 0.4 | 0.15 |
| 20.36666666666679 | 0.56 | 0.82 | 0.41 | 0.16 |
| 20.383333333333457 | 0.57 | 0.82 | 0.41 | 0.16 |
| 20.400000000000123 | 0.58 | 0.82 | 0.42 | 0.16 |
| 20.41666666666679 | 0.58 | 0.82 | 0.42 | 0.16 |
| 20.433333333333454 | 0.59 | 0.82 | 0.42 | 0.17 |
| 20.45000000000012 | 0.6 | 0.82 | 0.43 | 0.17 |
| 20.466666666666786 | 0.61 | 0.82 | 0.43 | 0.17 |
| 20.48333333333345 | 0.61 | 0.82 | 0.44 | 0.17 |
| 20.500000000000117 | 0.62 | 0.82 | 0.44 | 0.18 |
| 20.516666666666783 | 0.62 | 0.82 | 0.44 | 0.18 |
| 20.53333333333345 | 0.63 | 0.82 | 0.45 | 0.18 |
| 20.550000000000114 | 0.64 | 0.82 | 0.45 | 0.18 |
| 20.56666666666678 | 0.64 | 0.82 | 0.46 | 0.19 |
| 20.583333333333446 | 0.65 | 0.82 | 0.46 | 0.19 |
| 20.60000000000011 | 0.65 | 0.82 | 0.46 | 0.19 |
| 20.616666666666777 | 0.66 | 0.82 | 0.47 | 0.19 |
| 20.633333333333443 | 0.66 | 0.82 | 0.47 | 0.2 |
| 20.65000000000011 | 0.67 | 0.82 | 0.47 | 0.2 |
| 20.666666666666774 | 0.68 | 0.82 | 0.47 | 0.2 |
| 20.68333333333344 | 0.68 | 0.82 | 0.48 | 0.2 |
| 20.700000000000106 | 0.69 | 0.82 | 0.48 | 0.2 |
| 20.71666666666677 | 0.69 | 0.82 | 0.48 | 0.21 |
| 20.733333333333437 | 0.7 | 0.82 | 0.49 | 0.21 |
| 20.750000000000103 | 0.7 | 0.82 | 0.49 | 0.21 |
| 20.76666666666677 | 0.7 | 0.82 | 0.49 | 0.21 |
| 20.783333333333434 | 0.71 | 0.82 | 0.49 | 0.21 |
| 20.8000000000001 | 0.71 | 0.82 | 0.5 | 0.22 |
| 20.816666666666766 | 0.72 | 0.82 | 0.5 | 0.22 |
| 20.83333333333343 | 0.72 | 0.82 | 0.5 | 0.22 |
| 20.850000000000097 | 0.73 | 0.82 | 0.5 | 0.22 |
| 20.866666666666763 | 0.73 | 0.82 | 0.51 | 0.22 |
| 20.88333333333343 | 0.74 | 0.82 | 0.51 | 0.23 |
| 20.900000000000095 | 0.74 | 0.82 | 0.51 | 0.23 |
| 20.91666666666676 | 0.74 | 0.82 | 0.51 | 0.23 |
| 20.933333333333426 | 0.75 | 0.82 | 0.52 | 0.23 |
| 20.95000000000009 | 0.75 | 0.82 | 0.52 | 0.23 |
| 20.966666666666757 | 0.76 | 0.82 | 0.52 | 0.23 |
| 20.983333333333423 | 0.76 | 0.82 | 0.52 | 0.24 |
| 21.00000000000009 | 0.59 | 0.82 | 0.36 | 0.23 |
| 21.016666666666755 | 0.53 | 0.82 | 0.29 | 0.24 |
| 21.03333333333342 | 0.49 | 0.82 | 0.26 | 0.23 |
| 21.050000000000086 | 0.48 | 0.82 | 0.25 | 0.23 |
| 21.06666666666675 | 0.47 | 0.82 | 0.24 | 0.22 |
| 21.083333333333417 | 0.46 | 0.82 | 0.24 | 0.22 |
| 21.100000000000083 | 0.46 | 0.82 | 0.24 | 0.22 |
| 21.11666666666675 | 0.45 | 0.82 | 0.24 | 0.21 |
| 21.133333333333415 | 0.45 | 0.82 | 0.24 | 0.21 |
| 21.15000000000008 | 0.45 | 0.82 | 0.24 | 0.21 |
| 21.166666666666746 | 0.46 | 0.82 | 0.24 | 0.21 |
| 21.18333333333341 | 0.46 | 0.82 | 0.24 | 0.22 |
| 21.200000000000077 | 0.46 | 0.82 | 0.24 | 0.22 |
| 21.216666666666743 | 0.46 | 0.82 | 0.24 | 0.22 |
| 21.23333333333341 | 0.46 | 0.82 | 0.24 | 0.22 |
| 21.250000000000075 | 0.46 | 0.82 | 0.25 | 0.22 |
| 21.26666666666674 | 0.46 | 0.82 | 0.25 | 0.22 |
| 21.283333333333406 | 0.47 | 0.82 | 0.25 | 0.22 |
| 21.30000000000007 | 0.54 | 0.82 | 0.25 | 0.29 |
| 21.316666666666737 | 0.62 | 0.82 | 0.24 | 0.38 |
| 21.333333333333403 | 0.66 | 0.82 | 0.24 | 0.42 |
| 21.35000000000007 | 0.68 | 0.82 | 0.24 | 0.44 |
| 21.366666666666735 | 0.69 | 0.82 | 0.24 | 0.44 |
| 21.3833333333334 | 0.7 | 0.82 | 0.25 | 0.45 |
| 21.400000000000066 | 0.7 | 0.82 | 0.25 | 0.45 |
| 21.416666666666732 | 0.7 | 0.82 | 0.25 | 0.45 |
| 21.433333333333398 | 0.71 | 0.82 | 0.26 | 0.45 |
| 21.450000000000063 | 0.71 | 0.82 | 0.26 | 0.45 |
| 21.46666666666673 | 0.71 | 0.82 | 0.26 | 0.45 |
| 21.483333333333395 | 0.71 | 0.82 | 0.26 | 0.45 |
| 21.50000000000006 | 0.71 | 0.82 | 0.26 | 0.45 |
| 21.516666666666726 | 0.71 | 0.82 | 0.26 | 0.45 |
| 21.533333333333392 | 0.71 | 0.82 | 0.26 | 0.45 |
| 21.550000000000058 | 0.72 | 0.82 | 0.26 | 0.45 |
| 21.566666666666723 | 0.72 | 0.82 | 0.26 | 0.45 |
| 21.58333333333339 | 0.72 | 0.82 | 0.26 | 0.45 |
| 21.600000000000055 | 0.72 | 0.82 | 0.27 | 0.45 |
| 21.61666666666672 | 0.72 | 0.82 | 0.27 | 0.45 |
| 21.633333333333386 | 0.72 | 0.82 | 0.27 | 0.45 |
| 21.650000000000052 | 0.72 | 0.82 | 0.27 | 0.45 |
| 21.666666666666718 | 0.72 | 0.82 | 0.27 | 0.45 |
| 21.683333333333383 | 0.72 | 0.82 | 0.27 | 0.45 |
| 21.70000000000005 | 0.72 | 0.82 | 0.27 | 0.45 |
| 21.716666666666715 | 0.72 | 0.82 | 0.27 | 0.45 |
| 21.73333333333338 | 0.72 | 0.82 | 0.27 | 0.45 |
| 21.750000000000046 | 0.73 | 0.82 | 0.27 | 0.45 |
| 21.766666666666712 | 0.73 | 0.82 | 0.27 | 0.45 |
| 21.783333333333378 | 0.73 | 0.82 | 0.27 | 0.45 |
| 21.800000000000043 | 0.73 | 0.82 | 0.28 | 0.45 |
| 21.81666666666671 | 0.73 | 0.82 | 0.28 | 0.45 |
| 21.833333333333375 | 0.73 | 0.82 | 0.28 | 0.45 |
| 21.85000000000004 | 0.73 | 0.82 | 0.28 | 0.45 |
| 21.866666666666706 | 0.73 | 0.82 | 0.28 | 0.45 |
| 21.883333333333372 | 0.73 | 0.82 | 0.28 | 0.45 |
| 21.900000000000038 | 0.73 | 0.82 | 0.28 | 0.45 |
| 21.916666666666703 | 0.73 | 0.82 | 0.28 | 0.45 |
| 21.93333333333337 | 0.73 | 0.82 | 0.28 | 0.45 |
| 21.950000000000035 | 0.73 | 0.82 | 0.28 | 0.45 |
| 21.9666666666667 | 0.74 | 0.82 | 0.28 | 0.45 |
| 21.983333333333366 | 0.74 | 0.82 | 0.28 | 0.45 |
| 22.000000000000032 | 0.58 | 0.82 | 0.15 | 0.42 |
| 22.016666666666698 | 0.51 | 0.82 | 0.1 | 0.41 |
| 22.033333333333363 | 0.47 | 0.82 | 0.08 | 0.39 |
| 22.05000000000003 | 0.44 | 0.82 | 0.07 | 0.37 |
| 22.066666666666695 | 0.42 | 0.82 | 0.07 | 0.36 |
| 22.08333333333336 | 0.41 | 0.82 | 0.06 | 0.35 |
| 22.100000000000026 | 0.4 | 0.82 | 0.06 | 0.35 |
| 22.116666666666692 | 0.4 | 0.82 | 0.05 | 0.34 |
| 22.133333333333358 | 0.39 | 0.82 | 0.05 | 0.34 |
| 22.150000000000023 | 0.39 | 0.82 | 0.05 | 0.34 |
| 22.16666666666669 | 0.39 | 0.82 | 0.05 | 0.34 |
| 22.183333333333355 | 0.39 | 0.82 | 0.05 | 0.34 |
| 22.20000000000002 | 0.39 | 0.82 | 0.05 | 0.34 |
| 22.216666666666686 | 0.39 | 0.82 | 0.05 | 0.34 |
| 22.233333333333352 | 0.39 | 0.82 | 0.05 | 0.34 |
| 22.250000000000018 | 0.39 | 0.82 | 0.05 | 0.34 |
| 22.266666666666683 | 0.39 | 0.82 | 0.05 | 0.34 |
| 22.28333333333335 | 0.43 | 0.82 | 0.09 | 0.34 |
| 22.300000000000015 | 0.55 | 0.82 | 0.21 | 0.34 |
| 22.31666666666668 | 0.61 | 0.82 | 0.27 | 0.34 |
| 22.333333333333346 | 0.64 | 0.82 | 0.3 | 0.33 |
| 22.350000000000012 | 0.65 | 0.82 | 0.32 | 0.33 |
| 22.366666666666678 | 0.66 | 0.82 | 0.33 | 0.33 |
| 22.383333333333344 | 0.66 | 0.82 | 0.33 | 0.33 |
| 22.40000000000001 | 0.66 | 0.82 | 0.33 | 0.33 |
| 22.416666666666675 | 0.66 | 0.82 | 0.33 | 0.33 |
| 22.43333333333334 | 0.66 | 0.82 | 0.33 | 0.33 |
| 22.450000000000006 | 0.66 | 0.82 | 0.33 | 0.33 |
| 22.466666666666672 | 0.66 | 0.82 | 0.33 | 0.33 |
| 22.483333333333338 | 0.66 | 0.82 | 0.33 | 0.33 |
| 22.500000000000004 | 0.66 | 0.82 | 0.33 | 0.33 |
| 22.51666666666667 | 0.66 | 0.82 | 0.33 | 0.33 |
| 22.533333333333335 | 0.66 | 0.82 | 0.33 | 0.33 |
| 22.55 | 0.66 | 0.82 | 0.33 | 0.33 |
| 22.566666666666666 | 0.66 | 0.82 | 0.33 | 0.33 |
| 22.583333333333332 | 0.66 | 0.82 | 0.33 | 0.33 |
| 22.599999999999998 | 0.66 | 0.82 | 0.33 | 0.33 |
| 22.616666666666664 | 0.66 | 0.82 | 0.33 | 0.33 |
| 22.63333333333333 | 0.66 | 0.82 | 0.33 | 0.33 |
| 22.649999999999995 | 0.66 | 0.82 | 0.33 | 0.33 |
| 22.66666666666666 | 0.66 | 0.82 | 0.33 | 0.33 |
| 22.683333333333326 | 0.66 | 0.82 | 0.33 | 0.33 |
| 22.699999999999992 | 0.66 | 0.82 | 0.33 | 0.33 |
| 22.716666666666658 | 0.66 | 0.82 | 0.33 | 0.33 |
| 22.733333333333324 | 0.66 | 0.82 | 0.33 | 0.33 |
| 22.74999999999999 | 0.66 | 0.82 | 0.33 | 0.33 |
| 22.766666666666655 | 0.66 | 0.82 | 0.33 | 0.33 |
| 22.78333333333332 | 0.66 | 0.82 | 0.33 | 0.33 |
| 22.799999999999986 | 0.66 | 0.82 | 0.33 | 0.33 |
| 22.816666666666652 | 0.66 | 0.82 | 0.33 | 0.33 |
| 22.833333333333318 | 0.66 | 0.82 | 0.33 | 0.33 |
| 22.849999999999984 | 0.66 | 0.82 | 0.33 | 0.33 |
| 22.86666666666665 | 0.66 | 0.82 | 0.33 | 0.33 |
| 22.883333333333315 | 0.66 | 0.82 | 0.33 | 0.33 |
| 22.89999999999998 | 0.66 | 0.82 | 0.33 | 0.33 |
| 22.916666666666647 | 0.66 | 0.82 | 0.33 | 0.33 |
| 22.933333333333312 | 0.66 | 0.82 | 0.33 | 0.33 |
| 22.949999999999978 | 0.66 | 0.82 | 0.33 | 0.33 |
| 22.966666666666644 | 0.66 | 0.82 | 0.33 | 0.33 |
| 22.98333333333331 | 0.66 | 0.82 | 0.33 | 0.33 |
| 22.999999999999975 | 0.72 | 0.82 | 0.33 | 0.39 |
| 23.01666666666664 | 0.67 | 0.82 | 0.28 | 0.39 |
| 23.033333333333307 | 0.63 | 0.82 | 0.25 | 0.38 |
| 23.049999999999972 | 0.6 | 0.82 | 0.22 | 0.38 |
| 23.066666666666638 | 0.59 | 0.82 | 0.21 | 0.38 |
| 23.083333333333304 | 0.57 | 0.82 | 0.2 | 0.38 |
| 23.09999999999997 | 0.56 | 0.82 | 0.19 | 0.38 |
| 23.116666666666635 | 0.56 | 0.82 | 0.18 | 0.37 |
| 23.1333333333333 | 0.55 | 0.82 | 0.18 | 0.37 |
| 23.149999999999967 | 0.55 | 0.82 | 0.18 | 0.37 |
| 23.166666666666632 | 0.54 | 0.82 | 0.17 | 0.37 |
| 23.183333333333298 | 0.54 | 0.82 | 0.17 | 0.37 |
| 23.199999999999964 | 0.54 | 0.82 | 0.17 | 0.37 |
| 23.21666666666663 | 0.54 | 0.82 | 0.17 | 0.37 |
| 23.233333333333295 | 0.54 | 0.82 | 0.17 | 0.37 |
| 23.24999999999996 | 0.53 | 0.82 | 0.17 | 0.36 |
| 23.266666666666627 | 0.53 | 0.82 | 0.17 | 0.36 |
| 23.283333333333292 | 0.53 | 0.82 | 0.17 | 0.36 |
| 23.299999999999958 | 0.53 | 0.82 | 0.17 | 0.36 |
| 23.316666666666624 | 0.53 | 0.82 | 0.17 | 0.36 |
| 23.33333333333329 | 0.53 | 0.82 | 0.17 | 0.36 |
| 23.349999999999955 | 0.53 | 0.82 | 0.17 | 0.36 |
| 23.36666666666662 | 0.53 | 0.82 | 0.17 | 0.36 |
| 23.383333333333287 | 0.53 | 0.82 | 0.17 | 0.36 |
| 23.399999999999952 | 0.53 | 0.82 | 0.17 | 0.36 |
| 23.416666666666618 | 0.52 | 0.82 | 0.17 | 0.35 |
| 23.433333333333284 | 0.52 | 0.82 | 0.17 | 0.35 |
| 23.44999999999995 | 0.52 | 0.82 | 0.17 | 0.35 |
| 23.466666666666615 | 0.52 | 0.82 | 0.17 | 0.35 |
| 23.48333333333328 | 0.52 | 0.82 | 0.17 | 0.35 |
| 23.499999999999947 | 0.52 | 0.82 | 0.17 | 0.35 |
| 23.516666666666612 | 0.52 | 0.82 | 0.17 | 0.35 |
| 23.533333333333278 | 0.52 | 0.82 | 0.17 | 0.35 |
| 23.549999999999944 | 0.52 | 0.82 | 0.17 | 0.35 |
| 23.56666666666661 | 0.52 | 0.82 | 0.17 | 0.35 |
| 23.583333333333275 | 0.51 | 0.82 | 0.17 | 0.34 |
| 23.59999999999994 | 0.51 | 0.82 | 0.17 | 0.34 |
| 23.616666666666607 | 0.51 | 0.82 | 0.17 | 0.34 |
| 23.633333333333272 | 0.51 | 0.82 | 0.17 | 0.34 |
| 23.649999999999938 | 0.51 | 0.82 | 0.17 | 0.34 |
| 23.666666666666604 | 0.51 | 0.82 | 0.17 | 0.34 |
| 23.68333333333327 | 0.51 | 0.82 | 0.17 | 0.34 |
| 23.699999999999935 | 0.51 | 0.82 | 0.17 | 0.34 |
| 23.7166666666666 | 0.51 | 0.82 | 0.17 | 0.34 |
| 23.733333333333267 | 0.51 | 0.82 | 0.17 | 0.34 |
| 23.749999999999932 | 0.51 | 0.82 | 0.17 | 0.34 |
| 23.766666666666598 | 0.5 | 0.82 | 0.17 | 0.33 |
| 23.783333333333264 | 0.5 | 0.82 | 0.17 | 0.33 |
| 23.79999999999993 | 0.5 | 0.82 | 0.17 | 0.33 |
| 23.816666666666595 | 0.5 | 0.82 | 0.17 | 0.33 |
| 23.83333333333326 | 0.5 | 0.82 | 0.17 | 0.33 |
| 23.849999999999927 | 0.5 | 0.82 | 0.17 | 0.33 |
| 23.866666666666593 | 0.5 | 0.82 | 0.17 | 0.33 |
| 23.88333333333326 | 0.5 | 0.82 | 0.17 | 0.33 |
| 23.899999999999924 | 0.5 | 0.82 | 0.17 | 0.33 |
| 23.91666666666659 | 0.5 | 0.82 | 0.17 | 0.33 |
| 23.933333333333255 | 0.5 | 0.82 | 0.17 | 0.33 |
| 23.94999999999992 | 0.49 | 0.82 | 0.17 | 0.32 |
| 23.966666666666587 | 0.49 | 0.82 | 0.17 | 0.32 |
| 23.983333333333253 | 0.49 | 0.82 | 0.17 | 0.32 |
| 23.99999999999992 | 0.5 | 0.82 | 0.17 | 0.32 |
| 24.016666666666584 | 0.51 | 0.82 | 0.19 | 0.32 |
| 24.03333333333325 | 0.53 | 0.82 | 0.21 | 0.32 |
| 24.049999999999915 | 0.53 | 0.82 | 0.21 | 0.32 |
| 24.06666666666658 | 0.53 | 0.82 | 0.21 | 0.32 |
| 24.083333333333247 | 0.53 | 0.82 | 0.21 | 0.32 |
| 24.099999999999913 | 0.53 | 0.82 | 0.21 | 0.32 |
| 24.11666666666658 | 0.53 | 0.82 | 0.21 | 0.32 |
| 24.133333333333244 | 0.53 | 0.82 | 0.21 | 0.32 |
| 24.14999999999991 | 0.53 | 0.82 | 0.21 | 0.32 |
| 24.166666666666575 | 0.53 | 0.82 | 0.21 | 0.32 |
| 24.18333333333324 | 0.53 | 0.82 | 0.21 | 0.32 |
| 24.199999999999907 | 0.53 | 0.82 | 0.21 | 0.32 |
| 24.216666666666573 | 0.53 | 0.82 | 0.21 | 0.32 |
| 24.23333333333324 | 0.53 | 0.82 | 0.21 | 0.32 |
| 24.249999999999904 | 0.53 | 0.82 | 0.21 | 0.32 |
| 24.26666666666657 | 0.53 | 0.82 | 0.21 | 0.32 |
| 24.283333333333236 | 0.53 | 0.82 | 0.21 | 0.32 |
| 24.2999999999999 | 0.53 | 0.82 | 0.21 | 0.32 |
| 24.316666666666567 | 0.53 | 0.82 | 0.21 | 0.32 |
| 24.333333333333233 | 0.53 | 0.82 | 0.21 | 0.32 |
| 24.3499999999999 | 0.53 | 0.82 | 0.21 | 0.32 |
| 24.366666666666564 | 0.53 | 0.82 | 0.21 | 0.32 |
| 24.38333333333323 | 0.53 | 0.82 | 0.21 | 0.32 |
| 24.399999999999896 | 0.53 | 0.82 | 0.21 | 0.32 |
| 24.41666666666656 | 0.53 | 0.82 | 0.21 | 0.32 |
| 24.433333333333227 | 0.53 | 0.82 | 0.21 | 0.32 |
| 24.449999999999893 | 0.53 | 0.82 | 0.21 | 0.32 |
| 24.46666666666656 | 0.53 | 0.82 | 0.21 | 0.32 |
| 24.483333333333224 | 0.53 | 0.82 | 0.21 | 0.32 |
| 24.49999999999989 | 0.53 | 0.82 | 0.21 | 0.32 |
| 24.516666666666556 | 0.53 | 0.82 | 0.21 | 0.32 |
| 24.53333333333322 | 0.53 | 0.82 | 0.21 | 0.32 |
| 24.549999999999887 | 0.53 | 0.82 | 0.21 | 0.32 |
| 24.566666666666553 | 0.53 | 0.82 | 0.21 | 0.32 |
| 24.58333333333322 | 0.53 | 0.82 | 0.21 | 0.32 |
| 24.599999999999884 | 0.53 | 0.82 | 0.21 | 0.32 |
| 24.61666666666655 | 0.53 | 0.82 | 0.21 | 0.32 |
| 24.633333333333216 | 0.53 | 0.82 | 0.21 | 0.32 |
| 24.64999999999988 | 0.53 | 0.82 | 0.21 | 0.32 |
| 24.666666666666547 | 0.53 | 0.82 | 0.21 | 0.32 |
| 24.683333333333213 | 0.53 | 0.82 | 0.21 | 0.32 |
| 24.69999999999988 | 0.53 | 0.82 | 0.21 | 0.32 |
| 24.716666666666544 | 0.53 | 0.82 | 0.21 | 0.32 |
| 24.73333333333321 | 0.53 | 0.82 | 0.21 | 0.32 |
| 24.749999999999876 | 0.53 | 0.82 | 0.21 | 0.32 |
| 24.76666666666654 | 0.53 | 0.82 | 0.21 | 0.32 |
| 24.783333333333207 | 0.53 | 0.82 | 0.21 | 0.32 |
| 24.799999999999873 | 0.53 | 0.82 | 0.21 | 0.32 |
| 24.81666666666654 | 0.53 | 0.82 | 0.21 | 0.32 |
| 24.833333333333204 | 0.53 | 0.82 | 0.21 | 0.32 |
| 24.84999999999987 | 0.53 | 0.82 | 0.21 | 0.32 |
| 24.866666666666536 | 0.53 | 0.82 | 0.21 | 0.32 |
| 24.8833333333332 | 0.53 | 0.82 | 0.21 | 0.32 |
| 24.899999999999867 | 0.53 | 0.82 | 0.21 | 0.32 |
| 24.916666666666533 | 0.53 | 0.82 | 0.21 | 0.32 |
| 24.9333333333332 | 0.53 | 0.82 | 0.21 | 0.32 |
| 24.949999999999864 | 0.53 | 0.82 | 0.21 | 0.32 |
| 24.96666666666653 | 0.53 | 0.82 | 0.21 | 0.32 |
| 24.983333333333196 | 0.53 | 0.82 | 0.21 | 0.32 |
| 24.99999999999986 | 0.54 | 0.82 | 0.22 | 0.32 |